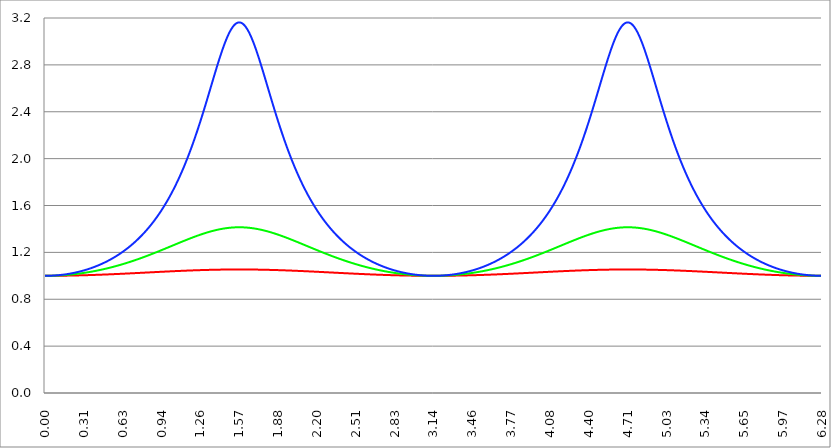
| Category | Series 1 | Series 0 | Series 2 |
|---|---|---|---|
| 0.0 | 1 | 1 | 1 |
| 0.00314159265358979 | 1 | 1 | 1 |
| 0.00628318530717958 | 1 | 1 | 1 |
| 0.00942477796076938 | 1 | 1 | 1 |
| 0.0125663706143592 | 1 | 1 | 1 |
| 0.015707963267949 | 1 | 1 | 1 |
| 0.0188495559215388 | 1 | 1 | 1 |
| 0.0219911485751285 | 1 | 1 | 1 |
| 0.0251327412287183 | 1 | 1 | 1 |
| 0.0282743338823081 | 1 | 1 | 1 |
| 0.0314159265358979 | 1 | 1 | 1 |
| 0.0345575191894877 | 1 | 1 | 1.001 |
| 0.0376991118430775 | 1 | 1 | 1.001 |
| 0.0408407044966673 | 1 | 1 | 1.001 |
| 0.0439822971502571 | 1 | 1 | 1.001 |
| 0.0471238898038469 | 1 | 1.001 | 1.001 |
| 0.0502654824574367 | 1 | 1.001 | 1.001 |
| 0.0534070751110265 | 1 | 1.001 | 1.001 |
| 0.0565486677646163 | 1 | 1.001 | 1.001 |
| 0.059690260418206 | 1 | 1.001 | 1.002 |
| 0.0628318530717958 | 1 | 1.001 | 1.002 |
| 0.0659734457253856 | 1 | 1.001 | 1.002 |
| 0.0691150383789754 | 1 | 1.001 | 1.002 |
| 0.0722566310325652 | 1 | 1.001 | 1.002 |
| 0.075398223686155 | 1 | 1.001 | 1.003 |
| 0.0785398163397448 | 1 | 1.002 | 1.003 |
| 0.0816814089933346 | 1 | 1.002 | 1.003 |
| 0.0848230016469244 | 1 | 1.002 | 1.003 |
| 0.0879645943005142 | 1 | 1.002 | 1.003 |
| 0.091106186954104 | 1 | 1.002 | 1.004 |
| 0.0942477796076937 | 1 | 1.002 | 1.004 |
| 0.0973893722612835 | 1 | 1.002 | 1.004 |
| 0.100530964914873 | 1.001 | 1.003 | 1.005 |
| 0.103672557568463 | 1.001 | 1.003 | 1.005 |
| 0.106814150222053 | 1.001 | 1.003 | 1.005 |
| 0.109955742875643 | 1.001 | 1.003 | 1.005 |
| 0.113097335529233 | 1.001 | 1.003 | 1.006 |
| 0.116238928182822 | 1.001 | 1.003 | 1.006 |
| 0.119380520836412 | 1.001 | 1.004 | 1.006 |
| 0.122522113490002 | 1.001 | 1.004 | 1.007 |
| 0.125663706143592 | 1.001 | 1.004 | 1.007 |
| 0.128805298797181 | 1.001 | 1.004 | 1.008 |
| 0.131946891450771 | 1.001 | 1.004 | 1.008 |
| 0.135088484104361 | 1.001 | 1.005 | 1.008 |
| 0.138230076757951 | 1.001 | 1.005 | 1.009 |
| 0.141371669411541 | 1.001 | 1.005 | 1.009 |
| 0.14451326206513 | 1.001 | 1.005 | 1.009 |
| 0.14765485471872 | 1.001 | 1.005 | 1.01 |
| 0.15079644737231 | 1.001 | 1.006 | 1.01 |
| 0.1539380400259 | 1.001 | 1.006 | 1.011 |
| 0.15707963267949 | 1.001 | 1.006 | 1.011 |
| 0.160221225333079 | 1.001 | 1.006 | 1.012 |
| 0.163362817986669 | 1.001 | 1.007 | 1.012 |
| 0.166504410640259 | 1.001 | 1.007 | 1.013 |
| 0.169646003293849 | 1.001 | 1.007 | 1.013 |
| 0.172787595947439 | 1.001 | 1.007 | 1.014 |
| 0.175929188601028 | 1.002 | 1.008 | 1.014 |
| 0.179070781254618 | 1.002 | 1.008 | 1.015 |
| 0.182212373908208 | 1.002 | 1.008 | 1.015 |
| 0.185353966561798 | 1.002 | 1.009 | 1.016 |
| 0.188495559215388 | 1.002 | 1.009 | 1.016 |
| 0.191637151868977 | 1.002 | 1.009 | 1.017 |
| 0.194778744522567 | 1.002 | 1.009 | 1.017 |
| 0.197920337176157 | 1.002 | 1.01 | 1.018 |
| 0.201061929829747 | 1.002 | 1.01 | 1.018 |
| 0.204203522483336 | 1.002 | 1.01 | 1.019 |
| 0.207345115136926 | 1.002 | 1.011 | 1.02 |
| 0.210486707790516 | 1.002 | 1.011 | 1.02 |
| 0.213628300444106 | 1.002 | 1.011 | 1.021 |
| 0.216769893097696 | 1.002 | 1.012 | 1.021 |
| 0.219911485751285 | 1.002 | 1.012 | 1.022 |
| 0.223053078404875 | 1.002 | 1.012 | 1.023 |
| 0.226194671058465 | 1.003 | 1.013 | 1.023 |
| 0.229336263712055 | 1.003 | 1.013 | 1.024 |
| 0.232477856365645 | 1.003 | 1.014 | 1.025 |
| 0.235619449019234 | 1.003 | 1.014 | 1.025 |
| 0.238761041672824 | 1.003 | 1.014 | 1.026 |
| 0.241902634326414 | 1.003 | 1.015 | 1.027 |
| 0.245044226980004 | 1.003 | 1.015 | 1.028 |
| 0.248185819633594 | 1.003 | 1.015 | 1.028 |
| 0.251327412287183 | 1.003 | 1.016 | 1.029 |
| 0.254469004940773 | 1.003 | 1.016 | 1.03 |
| 0.257610597594363 | 1.003 | 1.017 | 1.031 |
| 0.260752190247953 | 1.003 | 1.017 | 1.031 |
| 0.263893782901543 | 1.003 | 1.017 | 1.032 |
| 0.267035375555132 | 1.003 | 1.018 | 1.033 |
| 0.270176968208722 | 1.004 | 1.018 | 1.034 |
| 0.273318560862312 | 1.004 | 1.019 | 1.034 |
| 0.276460153515902 | 1.004 | 1.019 | 1.035 |
| 0.279601746169492 | 1.004 | 1.02 | 1.036 |
| 0.282743338823082 | 1.004 | 1.02 | 1.037 |
| 0.285884931476671 | 1.004 | 1.02 | 1.038 |
| 0.289026524130261 | 1.004 | 1.021 | 1.039 |
| 0.292168116783851 | 1.004 | 1.021 | 1.04 |
| 0.295309709437441 | 1.004 | 1.022 | 1.04 |
| 0.298451302091031 | 1.004 | 1.022 | 1.041 |
| 0.30159289474462 | 1.004 | 1.023 | 1.042 |
| 0.30473448739821 | 1.005 | 1.023 | 1.043 |
| 0.3078760800518 | 1.005 | 1.024 | 1.044 |
| 0.31101767270539 | 1.005 | 1.024 | 1.045 |
| 0.31415926535898 | 1.005 | 1.025 | 1.046 |
| 0.31730085801257 | 1.005 | 1.025 | 1.047 |
| 0.320442450666159 | 1.005 | 1.026 | 1.048 |
| 0.323584043319749 | 1.005 | 1.026 | 1.049 |
| 0.326725635973339 | 1.005 | 1.027 | 1.05 |
| 0.329867228626929 | 1.005 | 1.027 | 1.051 |
| 0.333008821280519 | 1.005 | 1.028 | 1.052 |
| 0.336150413934108 | 1.005 | 1.028 | 1.053 |
| 0.339292006587698 | 1.006 | 1.029 | 1.054 |
| 0.342433599241288 | 1.006 | 1.029 | 1.055 |
| 0.345575191894878 | 1.006 | 1.03 | 1.056 |
| 0.348716784548468 | 1.006 | 1.031 | 1.057 |
| 0.351858377202058 | 1.006 | 1.031 | 1.058 |
| 0.354999969855647 | 1.006 | 1.032 | 1.059 |
| 0.358141562509237 | 1.006 | 1.032 | 1.06 |
| 0.361283155162827 | 1.006 | 1.033 | 1.061 |
| 0.364424747816417 | 1.006 | 1.033 | 1.063 |
| 0.367566340470007 | 1.007 | 1.034 | 1.064 |
| 0.370707933123597 | 1.007 | 1.035 | 1.065 |
| 0.373849525777186 | 1.007 | 1.035 | 1.066 |
| 0.376991118430776 | 1.007 | 1.036 | 1.067 |
| 0.380132711084366 | 1.007 | 1.036 | 1.068 |
| 0.383274303737956 | 1.007 | 1.037 | 1.07 |
| 0.386415896391546 | 1.007 | 1.038 | 1.071 |
| 0.389557489045135 | 1.007 | 1.038 | 1.072 |
| 0.392699081698725 | 1.007 | 1.039 | 1.073 |
| 0.395840674352315 | 1.008 | 1.039 | 1.074 |
| 0.398982267005905 | 1.008 | 1.04 | 1.076 |
| 0.402123859659495 | 1.008 | 1.041 | 1.077 |
| 0.405265452313085 | 1.008 | 1.041 | 1.078 |
| 0.408407044966674 | 1.008 | 1.042 | 1.08 |
| 0.411548637620264 | 1.008 | 1.043 | 1.081 |
| 0.414690230273854 | 1.008 | 1.043 | 1.082 |
| 0.417831822927444 | 1.008 | 1.044 | 1.084 |
| 0.420973415581034 | 1.008 | 1.045 | 1.085 |
| 0.424115008234623 | 1.009 | 1.045 | 1.086 |
| 0.427256600888213 | 1.009 | 1.046 | 1.088 |
| 0.430398193541803 | 1.009 | 1.047 | 1.089 |
| 0.433539786195393 | 1.009 | 1.047 | 1.09 |
| 0.436681378848983 | 1.009 | 1.048 | 1.092 |
| 0.439822971502573 | 1.009 | 1.049 | 1.093 |
| 0.442964564156162 | 1.009 | 1.049 | 1.095 |
| 0.446106156809752 | 1.009 | 1.05 | 1.096 |
| 0.449247749463342 | 1.01 | 1.051 | 1.097 |
| 0.452389342116932 | 1.01 | 1.051 | 1.099 |
| 0.455530934770522 | 1.01 | 1.052 | 1.1 |
| 0.458672527424111 | 1.01 | 1.053 | 1.102 |
| 0.461814120077701 | 1.01 | 1.054 | 1.103 |
| 0.464955712731291 | 1.01 | 1.054 | 1.105 |
| 0.468097305384881 | 1.01 | 1.055 | 1.106 |
| 0.471238898038471 | 1.01 | 1.056 | 1.108 |
| 0.474380490692061 | 1.011 | 1.057 | 1.11 |
| 0.47752208334565 | 1.011 | 1.057 | 1.111 |
| 0.48066367599924 | 1.011 | 1.058 | 1.113 |
| 0.48380526865283 | 1.011 | 1.059 | 1.114 |
| 0.48694686130642 | 1.011 | 1.06 | 1.116 |
| 0.49008845396001 | 1.011 | 1.06 | 1.118 |
| 0.493230046613599 | 1.011 | 1.061 | 1.119 |
| 0.496371639267189 | 1.012 | 1.062 | 1.121 |
| 0.499513231920779 | 1.012 | 1.063 | 1.123 |
| 0.502654824574369 | 1.012 | 1.064 | 1.124 |
| 0.505796417227959 | 1.012 | 1.064 | 1.126 |
| 0.508938009881549 | 1.012 | 1.065 | 1.128 |
| 0.512079602535138 | 1.012 | 1.066 | 1.129 |
| 0.515221195188728 | 1.012 | 1.067 | 1.131 |
| 0.518362787842318 | 1.013 | 1.068 | 1.133 |
| 0.521504380495908 | 1.013 | 1.068 | 1.135 |
| 0.524645973149498 | 1.013 | 1.069 | 1.137 |
| 0.527787565803087 | 1.013 | 1.07 | 1.138 |
| 0.530929158456677 | 1.013 | 1.071 | 1.14 |
| 0.534070751110267 | 1.013 | 1.072 | 1.142 |
| 0.537212343763857 | 1.013 | 1.073 | 1.144 |
| 0.540353936417447 | 1.014 | 1.074 | 1.146 |
| 0.543495529071037 | 1.014 | 1.074 | 1.148 |
| 0.546637121724626 | 1.014 | 1.075 | 1.149 |
| 0.549778714378216 | 1.014 | 1.076 | 1.151 |
| 0.552920307031806 | 1.014 | 1.077 | 1.153 |
| 0.556061899685396 | 1.014 | 1.078 | 1.155 |
| 0.559203492338986 | 1.014 | 1.079 | 1.157 |
| 0.562345084992576 | 1.015 | 1.08 | 1.159 |
| 0.565486677646165 | 1.015 | 1.081 | 1.161 |
| 0.568628270299755 | 1.015 | 1.081 | 1.163 |
| 0.571769862953345 | 1.015 | 1.082 | 1.165 |
| 0.574911455606935 | 1.015 | 1.083 | 1.167 |
| 0.578053048260525 | 1.015 | 1.084 | 1.169 |
| 0.581194640914114 | 1.015 | 1.085 | 1.171 |
| 0.584336233567704 | 1.016 | 1.086 | 1.174 |
| 0.587477826221294 | 1.016 | 1.087 | 1.176 |
| 0.590619418874884 | 1.016 | 1.088 | 1.178 |
| 0.593761011528474 | 1.016 | 1.089 | 1.18 |
| 0.596902604182064 | 1.016 | 1.09 | 1.182 |
| 0.600044196835653 | 1.016 | 1.091 | 1.184 |
| 0.603185789489243 | 1.016 | 1.092 | 1.186 |
| 0.606327382142833 | 1.017 | 1.093 | 1.189 |
| 0.609468974796423 | 1.017 | 1.094 | 1.191 |
| 0.612610567450013 | 1.017 | 1.095 | 1.193 |
| 0.615752160103602 | 1.017 | 1.096 | 1.195 |
| 0.618893752757192 | 1.017 | 1.097 | 1.198 |
| 0.622035345410782 | 1.017 | 1.097 | 1.2 |
| 0.625176938064372 | 1.018 | 1.098 | 1.202 |
| 0.628318530717962 | 1.018 | 1.099 | 1.205 |
| 0.631460123371551 | 1.018 | 1.1 | 1.207 |
| 0.634601716025141 | 1.018 | 1.101 | 1.209 |
| 0.637743308678731 | 1.018 | 1.102 | 1.212 |
| 0.640884901332321 | 1.018 | 1.103 | 1.214 |
| 0.644026493985911 | 1.019 | 1.104 | 1.217 |
| 0.647168086639501 | 1.019 | 1.106 | 1.219 |
| 0.65030967929309 | 1.019 | 1.107 | 1.222 |
| 0.65345127194668 | 1.019 | 1.108 | 1.224 |
| 0.65659286460027 | 1.019 | 1.109 | 1.227 |
| 0.65973445725386 | 1.019 | 1.11 | 1.229 |
| 0.66287604990745 | 1.019 | 1.111 | 1.232 |
| 0.666017642561039 | 1.02 | 1.112 | 1.234 |
| 0.669159235214629 | 1.02 | 1.113 | 1.237 |
| 0.672300827868219 | 1.02 | 1.114 | 1.239 |
| 0.675442420521809 | 1.02 | 1.115 | 1.242 |
| 0.678584013175399 | 1.02 | 1.116 | 1.245 |
| 0.681725605828989 | 1.02 | 1.117 | 1.247 |
| 0.684867198482578 | 1.021 | 1.118 | 1.25 |
| 0.688008791136168 | 1.021 | 1.119 | 1.253 |
| 0.691150383789758 | 1.021 | 1.12 | 1.256 |
| 0.694291976443348 | 1.021 | 1.121 | 1.258 |
| 0.697433569096938 | 1.021 | 1.122 | 1.261 |
| 0.700575161750528 | 1.021 | 1.124 | 1.264 |
| 0.703716754404117 | 1.022 | 1.125 | 1.267 |
| 0.706858347057707 | 1.022 | 1.126 | 1.27 |
| 0.709999939711297 | 1.022 | 1.127 | 1.272 |
| 0.713141532364887 | 1.022 | 1.128 | 1.275 |
| 0.716283125018477 | 1.022 | 1.129 | 1.278 |
| 0.719424717672066 | 1.022 | 1.13 | 1.281 |
| 0.722566310325656 | 1.023 | 1.131 | 1.284 |
| 0.725707902979246 | 1.023 | 1.132 | 1.287 |
| 0.728849495632836 | 1.023 | 1.134 | 1.29 |
| 0.731991088286426 | 1.023 | 1.135 | 1.293 |
| 0.735132680940016 | 1.023 | 1.136 | 1.296 |
| 0.738274273593605 | 1.023 | 1.137 | 1.299 |
| 0.741415866247195 | 1.024 | 1.138 | 1.302 |
| 0.744557458900785 | 1.024 | 1.139 | 1.306 |
| 0.747699051554375 | 1.024 | 1.14 | 1.309 |
| 0.750840644207965 | 1.024 | 1.142 | 1.312 |
| 0.753982236861554 | 1.024 | 1.143 | 1.315 |
| 0.757123829515144 | 1.024 | 1.144 | 1.318 |
| 0.760265422168734 | 1.025 | 1.145 | 1.322 |
| 0.763407014822324 | 1.025 | 1.146 | 1.325 |
| 0.766548607475914 | 1.025 | 1.148 | 1.328 |
| 0.769690200129504 | 1.025 | 1.149 | 1.331 |
| 0.772831792783093 | 1.025 | 1.15 | 1.335 |
| 0.775973385436683 | 1.025 | 1.151 | 1.338 |
| 0.779114978090273 | 1.026 | 1.152 | 1.342 |
| 0.782256570743863 | 1.026 | 1.153 | 1.345 |
| 0.785398163397453 | 1.026 | 1.155 | 1.348 |
| 0.788539756051042 | 1.026 | 1.156 | 1.352 |
| 0.791681348704632 | 1.026 | 1.157 | 1.355 |
| 0.794822941358222 | 1.026 | 1.158 | 1.359 |
| 0.797964534011812 | 1.027 | 1.16 | 1.362 |
| 0.801106126665402 | 1.027 | 1.161 | 1.366 |
| 0.804247719318992 | 1.027 | 1.162 | 1.37 |
| 0.807389311972581 | 1.027 | 1.163 | 1.373 |
| 0.810530904626171 | 1.027 | 1.164 | 1.377 |
| 0.813672497279761 | 1.028 | 1.166 | 1.381 |
| 0.816814089933351 | 1.028 | 1.167 | 1.384 |
| 0.819955682586941 | 1.028 | 1.168 | 1.388 |
| 0.823097275240531 | 1.028 | 1.169 | 1.392 |
| 0.82623886789412 | 1.028 | 1.171 | 1.396 |
| 0.82938046054771 | 1.028 | 1.172 | 1.4 |
| 0.8325220532013 | 1.029 | 1.173 | 1.404 |
| 0.83566364585489 | 1.029 | 1.175 | 1.407 |
| 0.83880523850848 | 1.029 | 1.176 | 1.411 |
| 0.841946831162069 | 1.029 | 1.177 | 1.415 |
| 0.845088423815659 | 1.029 | 1.178 | 1.419 |
| 0.848230016469249 | 1.029 | 1.18 | 1.423 |
| 0.851371609122839 | 1.03 | 1.181 | 1.427 |
| 0.854513201776429 | 1.03 | 1.182 | 1.432 |
| 0.857654794430019 | 1.03 | 1.183 | 1.436 |
| 0.860796387083608 | 1.03 | 1.185 | 1.44 |
| 0.863937979737198 | 1.03 | 1.186 | 1.444 |
| 0.867079572390788 | 1.03 | 1.187 | 1.448 |
| 0.870221165044378 | 1.031 | 1.189 | 1.452 |
| 0.873362757697968 | 1.031 | 1.19 | 1.457 |
| 0.876504350351557 | 1.031 | 1.191 | 1.461 |
| 0.879645943005147 | 1.031 | 1.193 | 1.465 |
| 0.882787535658737 | 1.031 | 1.194 | 1.47 |
| 0.885929128312327 | 1.031 | 1.195 | 1.474 |
| 0.889070720965917 | 1.032 | 1.196 | 1.479 |
| 0.892212313619507 | 1.032 | 1.198 | 1.483 |
| 0.895353906273096 | 1.032 | 1.199 | 1.488 |
| 0.898495498926686 | 1.032 | 1.2 | 1.492 |
| 0.901637091580276 | 1.032 | 1.202 | 1.497 |
| 0.904778684233866 | 1.032 | 1.203 | 1.501 |
| 0.907920276887456 | 1.033 | 1.204 | 1.506 |
| 0.911061869541045 | 1.033 | 1.206 | 1.511 |
| 0.914203462194635 | 1.033 | 1.207 | 1.516 |
| 0.917345054848225 | 1.033 | 1.208 | 1.52 |
| 0.920486647501815 | 1.033 | 1.21 | 1.525 |
| 0.923628240155405 | 1.033 | 1.211 | 1.53 |
| 0.926769832808995 | 1.034 | 1.212 | 1.535 |
| 0.929911425462584 | 1.034 | 1.214 | 1.54 |
| 0.933053018116174 | 1.034 | 1.215 | 1.545 |
| 0.936194610769764 | 1.034 | 1.216 | 1.55 |
| 0.939336203423354 | 1.034 | 1.218 | 1.555 |
| 0.942477796076944 | 1.034 | 1.219 | 1.56 |
| 0.945619388730533 | 1.035 | 1.221 | 1.565 |
| 0.948760981384123 | 1.035 | 1.222 | 1.57 |
| 0.951902574037713 | 1.035 | 1.223 | 1.575 |
| 0.955044166691303 | 1.035 | 1.225 | 1.581 |
| 0.958185759344893 | 1.035 | 1.226 | 1.586 |
| 0.961327351998483 | 1.035 | 1.227 | 1.591 |
| 0.964468944652072 | 1.036 | 1.229 | 1.597 |
| 0.967610537305662 | 1.036 | 1.23 | 1.602 |
| 0.970752129959252 | 1.036 | 1.231 | 1.608 |
| 0.973893722612842 | 1.036 | 1.233 | 1.613 |
| 0.977035315266432 | 1.036 | 1.234 | 1.619 |
| 0.980176907920022 | 1.036 | 1.236 | 1.624 |
| 0.983318500573611 | 1.037 | 1.237 | 1.63 |
| 0.986460093227201 | 1.037 | 1.238 | 1.635 |
| 0.989601685880791 | 1.037 | 1.24 | 1.641 |
| 0.992743278534381 | 1.037 | 1.241 | 1.647 |
| 0.995884871187971 | 1.037 | 1.242 | 1.653 |
| 0.99902646384156 | 1.037 | 1.244 | 1.659 |
| 1.00216805649515 | 1.038 | 1.245 | 1.664 |
| 1.00530964914874 | 1.038 | 1.247 | 1.67 |
| 1.00845124180233 | 1.038 | 1.248 | 1.676 |
| 1.01159283445592 | 1.038 | 1.249 | 1.682 |
| 1.01473442710951 | 1.038 | 1.251 | 1.688 |
| 1.017876019763099 | 1.038 | 1.252 | 1.695 |
| 1.021017612416689 | 1.038 | 1.253 | 1.701 |
| 1.02415920507028 | 1.039 | 1.255 | 1.707 |
| 1.027300797723869 | 1.039 | 1.256 | 1.713 |
| 1.030442390377459 | 1.039 | 1.258 | 1.72 |
| 1.033583983031048 | 1.039 | 1.259 | 1.726 |
| 1.036725575684638 | 1.039 | 1.26 | 1.732 |
| 1.039867168338228 | 1.039 | 1.262 | 1.739 |
| 1.043008760991818 | 1.04 | 1.263 | 1.745 |
| 1.046150353645408 | 1.04 | 1.264 | 1.752 |
| 1.049291946298998 | 1.04 | 1.266 | 1.759 |
| 1.052433538952587 | 1.04 | 1.267 | 1.765 |
| 1.055575131606177 | 1.04 | 1.269 | 1.772 |
| 1.058716724259767 | 1.04 | 1.27 | 1.779 |
| 1.061858316913357 | 1.04 | 1.271 | 1.786 |
| 1.064999909566947 | 1.041 | 1.273 | 1.792 |
| 1.068141502220536 | 1.041 | 1.274 | 1.799 |
| 1.071283094874126 | 1.041 | 1.275 | 1.806 |
| 1.074424687527716 | 1.041 | 1.277 | 1.813 |
| 1.077566280181306 | 1.041 | 1.278 | 1.82 |
| 1.080707872834896 | 1.041 | 1.28 | 1.828 |
| 1.083849465488486 | 1.041 | 1.281 | 1.835 |
| 1.086991058142075 | 1.042 | 1.282 | 1.842 |
| 1.090132650795665 | 1.042 | 1.284 | 1.849 |
| 1.093274243449255 | 1.042 | 1.285 | 1.857 |
| 1.096415836102845 | 1.042 | 1.286 | 1.864 |
| 1.099557428756435 | 1.042 | 1.288 | 1.872 |
| 1.102699021410025 | 1.042 | 1.289 | 1.879 |
| 1.105840614063614 | 1.043 | 1.29 | 1.887 |
| 1.108982206717204 | 1.043 | 1.292 | 1.894 |
| 1.112123799370794 | 1.043 | 1.293 | 1.902 |
| 1.115265392024384 | 1.043 | 1.294 | 1.91 |
| 1.118406984677974 | 1.043 | 1.296 | 1.918 |
| 1.121548577331563 | 1.043 | 1.297 | 1.925 |
| 1.124690169985153 | 1.043 | 1.299 | 1.933 |
| 1.127831762638743 | 1.043 | 1.3 | 1.941 |
| 1.130973355292333 | 1.044 | 1.301 | 1.949 |
| 1.134114947945923 | 1.044 | 1.303 | 1.957 |
| 1.137256540599513 | 1.044 | 1.304 | 1.966 |
| 1.140398133253102 | 1.044 | 1.305 | 1.974 |
| 1.143539725906692 | 1.044 | 1.306 | 1.982 |
| 1.146681318560282 | 1.044 | 1.308 | 1.99 |
| 1.149822911213872 | 1.044 | 1.309 | 1.999 |
| 1.152964503867462 | 1.045 | 1.31 | 2.007 |
| 1.156106096521051 | 1.045 | 1.312 | 2.016 |
| 1.159247689174641 | 1.045 | 1.313 | 2.024 |
| 1.162389281828231 | 1.045 | 1.314 | 2.033 |
| 1.165530874481821 | 1.045 | 1.316 | 2.042 |
| 1.168672467135411 | 1.045 | 1.317 | 2.05 |
| 1.171814059789001 | 1.045 | 1.318 | 2.059 |
| 1.17495565244259 | 1.045 | 1.32 | 2.068 |
| 1.17809724509618 | 1.046 | 1.321 | 2.077 |
| 1.18123883774977 | 1.046 | 1.322 | 2.086 |
| 1.18438043040336 | 1.046 | 1.323 | 2.095 |
| 1.18752202305695 | 1.046 | 1.325 | 2.104 |
| 1.190663615710539 | 1.046 | 1.326 | 2.113 |
| 1.193805208364129 | 1.046 | 1.327 | 2.123 |
| 1.19694680101772 | 1.046 | 1.328 | 2.132 |
| 1.200088393671309 | 1.046 | 1.33 | 2.141 |
| 1.203229986324899 | 1.047 | 1.331 | 2.151 |
| 1.206371578978489 | 1.047 | 1.332 | 2.16 |
| 1.209513171632078 | 1.047 | 1.333 | 2.17 |
| 1.212654764285668 | 1.047 | 1.335 | 2.179 |
| 1.215796356939258 | 1.047 | 1.336 | 2.189 |
| 1.218937949592848 | 1.047 | 1.337 | 2.198 |
| 1.222079542246438 | 1.047 | 1.338 | 2.208 |
| 1.225221134900027 | 1.047 | 1.339 | 2.218 |
| 1.228362727553617 | 1.048 | 1.341 | 2.228 |
| 1.231504320207207 | 1.048 | 1.342 | 2.238 |
| 1.234645912860797 | 1.048 | 1.343 | 2.248 |
| 1.237787505514387 | 1.048 | 1.344 | 2.258 |
| 1.240929098167977 | 1.048 | 1.345 | 2.268 |
| 1.244070690821566 | 1.048 | 1.347 | 2.278 |
| 1.247212283475156 | 1.048 | 1.348 | 2.288 |
| 1.250353876128746 | 1.048 | 1.349 | 2.298 |
| 1.253495468782336 | 1.048 | 1.35 | 2.309 |
| 1.256637061435926 | 1.049 | 1.351 | 2.319 |
| 1.259778654089515 | 1.049 | 1.352 | 2.329 |
| 1.262920246743105 | 1.049 | 1.353 | 2.34 |
| 1.266061839396695 | 1.049 | 1.355 | 2.35 |
| 1.269203432050285 | 1.049 | 1.356 | 2.361 |
| 1.272345024703875 | 1.049 | 1.357 | 2.371 |
| 1.275486617357465 | 1.049 | 1.358 | 2.382 |
| 1.278628210011054 | 1.049 | 1.359 | 2.393 |
| 1.281769802664644 | 1.049 | 1.36 | 2.403 |
| 1.284911395318234 | 1.049 | 1.361 | 2.414 |
| 1.288052987971824 | 1.05 | 1.362 | 2.425 |
| 1.291194580625414 | 1.05 | 1.363 | 2.436 |
| 1.294336173279003 | 1.05 | 1.364 | 2.447 |
| 1.297477765932593 | 1.05 | 1.365 | 2.458 |
| 1.300619358586183 | 1.05 | 1.366 | 2.468 |
| 1.303760951239773 | 1.05 | 1.367 | 2.479 |
| 1.306902543893363 | 1.05 | 1.368 | 2.49 |
| 1.310044136546953 | 1.05 | 1.369 | 2.501 |
| 1.313185729200542 | 1.05 | 1.37 | 2.512 |
| 1.316327321854132 | 1.05 | 1.371 | 2.524 |
| 1.319468914507722 | 1.05 | 1.372 | 2.535 |
| 1.322610507161312 | 1.051 | 1.373 | 2.546 |
| 1.325752099814902 | 1.051 | 1.374 | 2.557 |
| 1.328893692468491 | 1.051 | 1.375 | 2.568 |
| 1.332035285122081 | 1.051 | 1.376 | 2.579 |
| 1.335176877775671 | 1.051 | 1.377 | 2.59 |
| 1.338318470429261 | 1.051 | 1.378 | 2.601 |
| 1.341460063082851 | 1.051 | 1.379 | 2.613 |
| 1.344601655736441 | 1.051 | 1.38 | 2.624 |
| 1.34774324839003 | 1.051 | 1.381 | 2.635 |
| 1.35088484104362 | 1.051 | 1.382 | 2.646 |
| 1.35402643369721 | 1.051 | 1.383 | 2.657 |
| 1.3571680263508 | 1.051 | 1.383 | 2.668 |
| 1.36030961900439 | 1.052 | 1.384 | 2.679 |
| 1.363451211657979 | 1.052 | 1.385 | 2.691 |
| 1.36659280431157 | 1.052 | 1.386 | 2.702 |
| 1.369734396965159 | 1.052 | 1.387 | 2.713 |
| 1.372875989618749 | 1.052 | 1.388 | 2.724 |
| 1.376017582272339 | 1.052 | 1.388 | 2.735 |
| 1.379159174925929 | 1.052 | 1.389 | 2.746 |
| 1.382300767579518 | 1.052 | 1.39 | 2.757 |
| 1.385442360233108 | 1.052 | 1.391 | 2.767 |
| 1.388583952886698 | 1.052 | 1.392 | 2.778 |
| 1.391725545540288 | 1.052 | 1.392 | 2.789 |
| 1.394867138193878 | 1.052 | 1.393 | 2.8 |
| 1.398008730847468 | 1.052 | 1.394 | 2.81 |
| 1.401150323501057 | 1.052 | 1.394 | 2.821 |
| 1.404291916154647 | 1.052 | 1.395 | 2.832 |
| 1.407433508808237 | 1.053 | 1.396 | 2.842 |
| 1.410575101461827 | 1.053 | 1.397 | 2.852 |
| 1.413716694115417 | 1.053 | 1.397 | 2.863 |
| 1.416858286769006 | 1.053 | 1.398 | 2.873 |
| 1.419999879422596 | 1.053 | 1.399 | 2.883 |
| 1.423141472076186 | 1.053 | 1.399 | 2.893 |
| 1.426283064729776 | 1.053 | 1.4 | 2.903 |
| 1.429424657383366 | 1.053 | 1.4 | 2.913 |
| 1.432566250036956 | 1.053 | 1.401 | 2.922 |
| 1.435707842690545 | 1.053 | 1.402 | 2.932 |
| 1.438849435344135 | 1.053 | 1.402 | 2.941 |
| 1.441991027997725 | 1.053 | 1.403 | 2.951 |
| 1.445132620651315 | 1.053 | 1.403 | 2.96 |
| 1.448274213304905 | 1.053 | 1.404 | 2.969 |
| 1.451415805958494 | 1.053 | 1.404 | 2.978 |
| 1.454557398612084 | 1.053 | 1.405 | 2.987 |
| 1.457698991265674 | 1.053 | 1.405 | 2.995 |
| 1.460840583919264 | 1.053 | 1.406 | 3.004 |
| 1.463982176572854 | 1.053 | 1.406 | 3.012 |
| 1.467123769226444 | 1.053 | 1.407 | 3.02 |
| 1.470265361880033 | 1.054 | 1.407 | 3.028 |
| 1.473406954533623 | 1.054 | 1.408 | 3.036 |
| 1.476548547187213 | 1.054 | 1.408 | 3.043 |
| 1.479690139840803 | 1.054 | 1.408 | 3.051 |
| 1.482831732494393 | 1.054 | 1.409 | 3.058 |
| 1.485973325147982 | 1.054 | 1.409 | 3.065 |
| 1.489114917801572 | 1.054 | 1.41 | 3.072 |
| 1.492256510455162 | 1.054 | 1.41 | 3.078 |
| 1.495398103108752 | 1.054 | 1.41 | 3.084 |
| 1.498539695762342 | 1.054 | 1.411 | 3.091 |
| 1.501681288415932 | 1.054 | 1.411 | 3.097 |
| 1.504822881069521 | 1.054 | 1.411 | 3.102 |
| 1.507964473723111 | 1.054 | 1.411 | 3.108 |
| 1.511106066376701 | 1.054 | 1.412 | 3.113 |
| 1.514247659030291 | 1.054 | 1.412 | 3.118 |
| 1.517389251683881 | 1.054 | 1.412 | 3.122 |
| 1.520530844337471 | 1.054 | 1.412 | 3.127 |
| 1.52367243699106 | 1.054 | 1.413 | 3.131 |
| 1.52681402964465 | 1.054 | 1.413 | 3.135 |
| 1.52995562229824 | 1.054 | 1.413 | 3.139 |
| 1.53309721495183 | 1.054 | 1.413 | 3.142 |
| 1.53623880760542 | 1.054 | 1.413 | 3.145 |
| 1.539380400259009 | 1.054 | 1.414 | 3.148 |
| 1.542521992912599 | 1.054 | 1.414 | 3.151 |
| 1.545663585566189 | 1.054 | 1.414 | 3.153 |
| 1.548805178219779 | 1.054 | 1.414 | 3.155 |
| 1.551946770873369 | 1.054 | 1.414 | 3.157 |
| 1.555088363526959 | 1.054 | 1.414 | 3.159 |
| 1.558229956180548 | 1.054 | 1.414 | 3.16 |
| 1.561371548834138 | 1.054 | 1.414 | 3.161 |
| 1.564513141487728 | 1.054 | 1.414 | 3.162 |
| 1.567654734141318 | 1.054 | 1.414 | 3.162 |
| 1.570796326794908 | 1.054 | 1.414 | 3.162 |
| 1.573937919448497 | 1.054 | 1.414 | 3.162 |
| 1.577079512102087 | 1.054 | 1.414 | 3.162 |
| 1.580221104755677 | 1.054 | 1.414 | 3.161 |
| 1.583362697409267 | 1.054 | 1.414 | 3.16 |
| 1.586504290062857 | 1.054 | 1.414 | 3.159 |
| 1.589645882716447 | 1.054 | 1.414 | 3.157 |
| 1.592787475370036 | 1.054 | 1.414 | 3.155 |
| 1.595929068023626 | 1.054 | 1.414 | 3.153 |
| 1.599070660677216 | 1.054 | 1.414 | 3.151 |
| 1.602212253330806 | 1.054 | 1.414 | 3.148 |
| 1.605353845984396 | 1.054 | 1.413 | 3.145 |
| 1.608495438637985 | 1.054 | 1.413 | 3.142 |
| 1.611637031291575 | 1.054 | 1.413 | 3.139 |
| 1.614778623945165 | 1.054 | 1.413 | 3.135 |
| 1.617920216598755 | 1.054 | 1.413 | 3.131 |
| 1.621061809252345 | 1.054 | 1.412 | 3.127 |
| 1.624203401905935 | 1.054 | 1.412 | 3.122 |
| 1.627344994559524 | 1.054 | 1.412 | 3.118 |
| 1.630486587213114 | 1.054 | 1.412 | 3.113 |
| 1.633628179866704 | 1.054 | 1.411 | 3.108 |
| 1.636769772520294 | 1.054 | 1.411 | 3.102 |
| 1.639911365173884 | 1.054 | 1.411 | 3.097 |
| 1.643052957827473 | 1.054 | 1.411 | 3.091 |
| 1.646194550481063 | 1.054 | 1.41 | 3.084 |
| 1.649336143134653 | 1.054 | 1.41 | 3.078 |
| 1.652477735788243 | 1.054 | 1.41 | 3.072 |
| 1.655619328441833 | 1.054 | 1.409 | 3.065 |
| 1.658760921095423 | 1.054 | 1.409 | 3.058 |
| 1.661902513749012 | 1.054 | 1.408 | 3.051 |
| 1.665044106402602 | 1.054 | 1.408 | 3.043 |
| 1.668185699056192 | 1.054 | 1.408 | 3.036 |
| 1.671327291709782 | 1.054 | 1.407 | 3.028 |
| 1.674468884363372 | 1.053 | 1.407 | 3.02 |
| 1.677610477016961 | 1.053 | 1.406 | 3.012 |
| 1.680752069670551 | 1.053 | 1.406 | 3.004 |
| 1.683893662324141 | 1.053 | 1.405 | 2.995 |
| 1.687035254977731 | 1.053 | 1.405 | 2.987 |
| 1.690176847631321 | 1.053 | 1.404 | 2.978 |
| 1.693318440284911 | 1.053 | 1.404 | 2.969 |
| 1.6964600329385 | 1.053 | 1.403 | 2.96 |
| 1.69960162559209 | 1.053 | 1.403 | 2.951 |
| 1.70274321824568 | 1.053 | 1.402 | 2.941 |
| 1.70588481089927 | 1.053 | 1.402 | 2.932 |
| 1.70902640355286 | 1.053 | 1.401 | 2.922 |
| 1.712167996206449 | 1.053 | 1.4 | 2.913 |
| 1.715309588860039 | 1.053 | 1.4 | 2.903 |
| 1.71845118151363 | 1.053 | 1.399 | 2.893 |
| 1.721592774167219 | 1.053 | 1.399 | 2.883 |
| 1.724734366820809 | 1.053 | 1.398 | 2.873 |
| 1.727875959474399 | 1.053 | 1.397 | 2.863 |
| 1.731017552127988 | 1.053 | 1.397 | 2.852 |
| 1.734159144781578 | 1.053 | 1.396 | 2.842 |
| 1.737300737435168 | 1.052 | 1.395 | 2.832 |
| 1.740442330088758 | 1.052 | 1.394 | 2.821 |
| 1.743583922742348 | 1.052 | 1.394 | 2.81 |
| 1.746725515395937 | 1.052 | 1.393 | 2.8 |
| 1.749867108049527 | 1.052 | 1.392 | 2.789 |
| 1.753008700703117 | 1.052 | 1.392 | 2.778 |
| 1.756150293356707 | 1.052 | 1.391 | 2.767 |
| 1.759291886010297 | 1.052 | 1.39 | 2.757 |
| 1.762433478663887 | 1.052 | 1.389 | 2.746 |
| 1.765575071317476 | 1.052 | 1.388 | 2.735 |
| 1.768716663971066 | 1.052 | 1.388 | 2.724 |
| 1.771858256624656 | 1.052 | 1.387 | 2.713 |
| 1.774999849278246 | 1.052 | 1.386 | 2.702 |
| 1.778141441931836 | 1.052 | 1.385 | 2.691 |
| 1.781283034585426 | 1.052 | 1.384 | 2.679 |
| 1.784424627239015 | 1.051 | 1.383 | 2.668 |
| 1.787566219892605 | 1.051 | 1.383 | 2.657 |
| 1.790707812546195 | 1.051 | 1.382 | 2.646 |
| 1.793849405199785 | 1.051 | 1.381 | 2.635 |
| 1.796990997853375 | 1.051 | 1.38 | 2.624 |
| 1.800132590506964 | 1.051 | 1.379 | 2.613 |
| 1.803274183160554 | 1.051 | 1.378 | 2.601 |
| 1.806415775814144 | 1.051 | 1.377 | 2.59 |
| 1.809557368467734 | 1.051 | 1.376 | 2.579 |
| 1.812698961121324 | 1.051 | 1.375 | 2.568 |
| 1.815840553774914 | 1.051 | 1.374 | 2.557 |
| 1.818982146428503 | 1.051 | 1.373 | 2.546 |
| 1.822123739082093 | 1.05 | 1.372 | 2.535 |
| 1.825265331735683 | 1.05 | 1.371 | 2.524 |
| 1.828406924389273 | 1.05 | 1.37 | 2.512 |
| 1.831548517042863 | 1.05 | 1.369 | 2.501 |
| 1.834690109696452 | 1.05 | 1.368 | 2.49 |
| 1.837831702350042 | 1.05 | 1.367 | 2.479 |
| 1.840973295003632 | 1.05 | 1.366 | 2.468 |
| 1.844114887657222 | 1.05 | 1.365 | 2.458 |
| 1.847256480310812 | 1.05 | 1.364 | 2.447 |
| 1.850398072964402 | 1.05 | 1.363 | 2.436 |
| 1.853539665617991 | 1.05 | 1.362 | 2.425 |
| 1.856681258271581 | 1.049 | 1.361 | 2.414 |
| 1.859822850925171 | 1.049 | 1.36 | 2.403 |
| 1.862964443578761 | 1.049 | 1.359 | 2.393 |
| 1.866106036232351 | 1.049 | 1.358 | 2.382 |
| 1.86924762888594 | 1.049 | 1.357 | 2.371 |
| 1.87238922153953 | 1.049 | 1.356 | 2.361 |
| 1.87553081419312 | 1.049 | 1.355 | 2.35 |
| 1.87867240684671 | 1.049 | 1.353 | 2.34 |
| 1.8818139995003 | 1.049 | 1.352 | 2.329 |
| 1.88495559215389 | 1.049 | 1.351 | 2.319 |
| 1.888097184807479 | 1.048 | 1.35 | 2.309 |
| 1.891238777461069 | 1.048 | 1.349 | 2.298 |
| 1.89438037011466 | 1.048 | 1.348 | 2.288 |
| 1.897521962768249 | 1.048 | 1.347 | 2.278 |
| 1.900663555421839 | 1.048 | 1.345 | 2.268 |
| 1.903805148075429 | 1.048 | 1.344 | 2.258 |
| 1.906946740729018 | 1.048 | 1.343 | 2.248 |
| 1.910088333382608 | 1.048 | 1.342 | 2.238 |
| 1.913229926036198 | 1.048 | 1.341 | 2.228 |
| 1.916371518689788 | 1.047 | 1.339 | 2.218 |
| 1.919513111343378 | 1.047 | 1.338 | 2.208 |
| 1.922654703996967 | 1.047 | 1.337 | 2.198 |
| 1.925796296650557 | 1.047 | 1.336 | 2.189 |
| 1.928937889304147 | 1.047 | 1.335 | 2.179 |
| 1.932079481957737 | 1.047 | 1.333 | 2.17 |
| 1.935221074611327 | 1.047 | 1.332 | 2.16 |
| 1.938362667264917 | 1.047 | 1.331 | 2.151 |
| 1.941504259918506 | 1.046 | 1.33 | 2.141 |
| 1.944645852572096 | 1.046 | 1.328 | 2.132 |
| 1.947787445225686 | 1.046 | 1.327 | 2.123 |
| 1.950929037879276 | 1.046 | 1.326 | 2.113 |
| 1.954070630532866 | 1.046 | 1.325 | 2.104 |
| 1.957212223186455 | 1.046 | 1.323 | 2.095 |
| 1.960353815840045 | 1.046 | 1.322 | 2.086 |
| 1.963495408493635 | 1.046 | 1.321 | 2.077 |
| 1.966637001147225 | 1.045 | 1.32 | 2.068 |
| 1.969778593800815 | 1.045 | 1.318 | 2.059 |
| 1.972920186454405 | 1.045 | 1.317 | 2.05 |
| 1.976061779107994 | 1.045 | 1.316 | 2.042 |
| 1.979203371761584 | 1.045 | 1.314 | 2.033 |
| 1.982344964415174 | 1.045 | 1.313 | 2.024 |
| 1.985486557068764 | 1.045 | 1.312 | 2.016 |
| 1.988628149722354 | 1.045 | 1.31 | 2.007 |
| 1.991769742375943 | 1.044 | 1.309 | 1.999 |
| 1.994911335029533 | 1.044 | 1.308 | 1.99 |
| 1.998052927683123 | 1.044 | 1.306 | 1.982 |
| 2.001194520336712 | 1.044 | 1.305 | 1.974 |
| 2.004336112990302 | 1.044 | 1.304 | 1.966 |
| 2.007477705643892 | 1.044 | 1.303 | 1.957 |
| 2.010619298297482 | 1.044 | 1.301 | 1.949 |
| 2.013760890951071 | 1.043 | 1.3 | 1.941 |
| 2.016902483604661 | 1.043 | 1.299 | 1.933 |
| 2.02004407625825 | 1.043 | 1.297 | 1.925 |
| 2.02318566891184 | 1.043 | 1.296 | 1.918 |
| 2.02632726156543 | 1.043 | 1.294 | 1.91 |
| 2.029468854219019 | 1.043 | 1.293 | 1.902 |
| 2.032610446872609 | 1.043 | 1.292 | 1.894 |
| 2.035752039526198 | 1.043 | 1.29 | 1.887 |
| 2.038893632179788 | 1.042 | 1.289 | 1.879 |
| 2.042035224833378 | 1.042 | 1.288 | 1.872 |
| 2.045176817486967 | 1.042 | 1.286 | 1.864 |
| 2.048318410140557 | 1.042 | 1.285 | 1.857 |
| 2.051460002794146 | 1.042 | 1.284 | 1.849 |
| 2.054601595447736 | 1.042 | 1.282 | 1.842 |
| 2.057743188101325 | 1.041 | 1.281 | 1.835 |
| 2.060884780754915 | 1.041 | 1.28 | 1.828 |
| 2.064026373408505 | 1.041 | 1.278 | 1.82 |
| 2.067167966062094 | 1.041 | 1.277 | 1.813 |
| 2.070309558715684 | 1.041 | 1.275 | 1.806 |
| 2.073451151369273 | 1.041 | 1.274 | 1.799 |
| 2.076592744022863 | 1.041 | 1.273 | 1.792 |
| 2.079734336676452 | 1.04 | 1.271 | 1.786 |
| 2.082875929330042 | 1.04 | 1.27 | 1.779 |
| 2.086017521983632 | 1.04 | 1.269 | 1.772 |
| 2.089159114637221 | 1.04 | 1.267 | 1.765 |
| 2.092300707290811 | 1.04 | 1.266 | 1.759 |
| 2.095442299944401 | 1.04 | 1.264 | 1.752 |
| 2.09858389259799 | 1.04 | 1.263 | 1.745 |
| 2.10172548525158 | 1.039 | 1.262 | 1.739 |
| 2.104867077905169 | 1.039 | 1.26 | 1.732 |
| 2.108008670558759 | 1.039 | 1.259 | 1.726 |
| 2.111150263212349 | 1.039 | 1.258 | 1.72 |
| 2.114291855865938 | 1.039 | 1.256 | 1.713 |
| 2.117433448519528 | 1.039 | 1.255 | 1.707 |
| 2.120575041173117 | 1.038 | 1.253 | 1.701 |
| 2.123716633826707 | 1.038 | 1.252 | 1.695 |
| 2.126858226480297 | 1.038 | 1.251 | 1.688 |
| 2.129999819133886 | 1.038 | 1.249 | 1.682 |
| 2.133141411787476 | 1.038 | 1.248 | 1.676 |
| 2.136283004441065 | 1.038 | 1.247 | 1.67 |
| 2.139424597094655 | 1.038 | 1.245 | 1.664 |
| 2.142566189748245 | 1.037 | 1.244 | 1.659 |
| 2.145707782401834 | 1.037 | 1.242 | 1.653 |
| 2.148849375055424 | 1.037 | 1.241 | 1.647 |
| 2.151990967709013 | 1.037 | 1.24 | 1.641 |
| 2.155132560362603 | 1.037 | 1.238 | 1.635 |
| 2.158274153016193 | 1.037 | 1.237 | 1.63 |
| 2.161415745669782 | 1.036 | 1.236 | 1.624 |
| 2.164557338323372 | 1.036 | 1.234 | 1.619 |
| 2.167698930976961 | 1.036 | 1.233 | 1.613 |
| 2.170840523630551 | 1.036 | 1.231 | 1.608 |
| 2.173982116284141 | 1.036 | 1.23 | 1.602 |
| 2.17712370893773 | 1.036 | 1.229 | 1.597 |
| 2.18026530159132 | 1.035 | 1.227 | 1.591 |
| 2.183406894244909 | 1.035 | 1.226 | 1.586 |
| 2.186548486898499 | 1.035 | 1.225 | 1.581 |
| 2.189690079552089 | 1.035 | 1.223 | 1.575 |
| 2.192831672205678 | 1.035 | 1.222 | 1.57 |
| 2.195973264859268 | 1.035 | 1.221 | 1.565 |
| 2.199114857512857 | 1.034 | 1.219 | 1.56 |
| 2.202256450166447 | 1.034 | 1.218 | 1.555 |
| 2.205398042820036 | 1.034 | 1.216 | 1.55 |
| 2.208539635473626 | 1.034 | 1.215 | 1.545 |
| 2.211681228127216 | 1.034 | 1.214 | 1.54 |
| 2.214822820780805 | 1.034 | 1.212 | 1.535 |
| 2.217964413434395 | 1.033 | 1.211 | 1.53 |
| 2.221106006087984 | 1.033 | 1.21 | 1.525 |
| 2.224247598741574 | 1.033 | 1.208 | 1.52 |
| 2.227389191395164 | 1.033 | 1.207 | 1.516 |
| 2.230530784048753 | 1.033 | 1.206 | 1.511 |
| 2.233672376702343 | 1.033 | 1.204 | 1.506 |
| 2.236813969355933 | 1.032 | 1.203 | 1.501 |
| 2.239955562009522 | 1.032 | 1.202 | 1.497 |
| 2.243097154663112 | 1.032 | 1.2 | 1.492 |
| 2.246238747316701 | 1.032 | 1.199 | 1.488 |
| 2.249380339970291 | 1.032 | 1.198 | 1.483 |
| 2.252521932623881 | 1.032 | 1.196 | 1.479 |
| 2.25566352527747 | 1.031 | 1.195 | 1.474 |
| 2.25880511793106 | 1.031 | 1.194 | 1.47 |
| 2.261946710584649 | 1.031 | 1.193 | 1.465 |
| 2.265088303238239 | 1.031 | 1.191 | 1.461 |
| 2.268229895891829 | 1.031 | 1.19 | 1.457 |
| 2.271371488545418 | 1.031 | 1.189 | 1.452 |
| 2.274513081199008 | 1.03 | 1.187 | 1.448 |
| 2.277654673852597 | 1.03 | 1.186 | 1.444 |
| 2.280796266506186 | 1.03 | 1.185 | 1.44 |
| 2.283937859159776 | 1.03 | 1.183 | 1.436 |
| 2.287079451813366 | 1.03 | 1.182 | 1.432 |
| 2.290221044466955 | 1.03 | 1.181 | 1.427 |
| 2.293362637120545 | 1.029 | 1.18 | 1.423 |
| 2.296504229774135 | 1.029 | 1.178 | 1.419 |
| 2.299645822427724 | 1.029 | 1.177 | 1.415 |
| 2.302787415081314 | 1.029 | 1.176 | 1.411 |
| 2.305929007734904 | 1.029 | 1.175 | 1.407 |
| 2.309070600388493 | 1.029 | 1.173 | 1.404 |
| 2.312212193042083 | 1.028 | 1.172 | 1.4 |
| 2.315353785695672 | 1.028 | 1.171 | 1.396 |
| 2.318495378349262 | 1.028 | 1.169 | 1.392 |
| 2.321636971002852 | 1.028 | 1.168 | 1.388 |
| 2.324778563656441 | 1.028 | 1.167 | 1.384 |
| 2.327920156310031 | 1.028 | 1.166 | 1.381 |
| 2.33106174896362 | 1.027 | 1.164 | 1.377 |
| 2.33420334161721 | 1.027 | 1.163 | 1.373 |
| 2.3373449342708 | 1.027 | 1.162 | 1.37 |
| 2.340486526924389 | 1.027 | 1.161 | 1.366 |
| 2.343628119577979 | 1.027 | 1.16 | 1.362 |
| 2.346769712231568 | 1.026 | 1.158 | 1.359 |
| 2.349911304885158 | 1.026 | 1.157 | 1.355 |
| 2.353052897538748 | 1.026 | 1.156 | 1.352 |
| 2.356194490192337 | 1.026 | 1.155 | 1.348 |
| 2.359336082845927 | 1.026 | 1.153 | 1.345 |
| 2.362477675499516 | 1.026 | 1.152 | 1.342 |
| 2.365619268153106 | 1.025 | 1.151 | 1.338 |
| 2.368760860806696 | 1.025 | 1.15 | 1.335 |
| 2.371902453460285 | 1.025 | 1.149 | 1.331 |
| 2.375044046113875 | 1.025 | 1.148 | 1.328 |
| 2.378185638767464 | 1.025 | 1.146 | 1.325 |
| 2.381327231421054 | 1.025 | 1.145 | 1.322 |
| 2.384468824074644 | 1.024 | 1.144 | 1.318 |
| 2.387610416728233 | 1.024 | 1.143 | 1.315 |
| 2.390752009381823 | 1.024 | 1.142 | 1.312 |
| 2.393893602035412 | 1.024 | 1.14 | 1.309 |
| 2.397035194689002 | 1.024 | 1.139 | 1.306 |
| 2.400176787342591 | 1.024 | 1.138 | 1.302 |
| 2.403318379996181 | 1.023 | 1.137 | 1.299 |
| 2.406459972649771 | 1.023 | 1.136 | 1.296 |
| 2.40960156530336 | 1.023 | 1.135 | 1.293 |
| 2.41274315795695 | 1.023 | 1.134 | 1.29 |
| 2.41588475061054 | 1.023 | 1.132 | 1.287 |
| 2.419026343264129 | 1.023 | 1.131 | 1.284 |
| 2.422167935917719 | 1.022 | 1.13 | 1.281 |
| 2.425309528571308 | 1.022 | 1.129 | 1.278 |
| 2.428451121224898 | 1.022 | 1.128 | 1.275 |
| 2.431592713878488 | 1.022 | 1.127 | 1.272 |
| 2.434734306532077 | 1.022 | 1.126 | 1.27 |
| 2.437875899185667 | 1.022 | 1.125 | 1.267 |
| 2.441017491839256 | 1.021 | 1.124 | 1.264 |
| 2.444159084492846 | 1.021 | 1.122 | 1.261 |
| 2.447300677146435 | 1.021 | 1.121 | 1.258 |
| 2.450442269800025 | 1.021 | 1.12 | 1.256 |
| 2.453583862453615 | 1.021 | 1.119 | 1.253 |
| 2.456725455107204 | 1.021 | 1.118 | 1.25 |
| 2.459867047760794 | 1.02 | 1.117 | 1.247 |
| 2.463008640414384 | 1.02 | 1.116 | 1.245 |
| 2.466150233067973 | 1.02 | 1.115 | 1.242 |
| 2.469291825721563 | 1.02 | 1.114 | 1.239 |
| 2.472433418375152 | 1.02 | 1.113 | 1.237 |
| 2.475575011028742 | 1.02 | 1.112 | 1.234 |
| 2.478716603682332 | 1.019 | 1.111 | 1.232 |
| 2.481858196335921 | 1.019 | 1.11 | 1.229 |
| 2.48499978898951 | 1.019 | 1.109 | 1.227 |
| 2.4881413816431 | 1.019 | 1.108 | 1.224 |
| 2.49128297429669 | 1.019 | 1.107 | 1.222 |
| 2.49442456695028 | 1.019 | 1.106 | 1.219 |
| 2.497566159603869 | 1.019 | 1.104 | 1.217 |
| 2.500707752257458 | 1.018 | 1.103 | 1.214 |
| 2.503849344911048 | 1.018 | 1.102 | 1.212 |
| 2.506990937564638 | 1.018 | 1.101 | 1.209 |
| 2.510132530218228 | 1.018 | 1.1 | 1.207 |
| 2.513274122871817 | 1.018 | 1.099 | 1.205 |
| 2.516415715525407 | 1.018 | 1.098 | 1.202 |
| 2.519557308178996 | 1.017 | 1.097 | 1.2 |
| 2.522698900832586 | 1.017 | 1.097 | 1.198 |
| 2.525840493486176 | 1.017 | 1.096 | 1.195 |
| 2.528982086139765 | 1.017 | 1.095 | 1.193 |
| 2.532123678793355 | 1.017 | 1.094 | 1.191 |
| 2.535265271446944 | 1.017 | 1.093 | 1.189 |
| 2.538406864100534 | 1.016 | 1.092 | 1.186 |
| 2.541548456754124 | 1.016 | 1.091 | 1.184 |
| 2.544690049407713 | 1.016 | 1.09 | 1.182 |
| 2.547831642061302 | 1.016 | 1.089 | 1.18 |
| 2.550973234714892 | 1.016 | 1.088 | 1.178 |
| 2.554114827368482 | 1.016 | 1.087 | 1.176 |
| 2.557256420022072 | 1.016 | 1.086 | 1.174 |
| 2.560398012675661 | 1.015 | 1.085 | 1.171 |
| 2.563539605329251 | 1.015 | 1.084 | 1.169 |
| 2.56668119798284 | 1.015 | 1.083 | 1.167 |
| 2.56982279063643 | 1.015 | 1.082 | 1.165 |
| 2.57296438329002 | 1.015 | 1.081 | 1.163 |
| 2.576105975943609 | 1.015 | 1.081 | 1.161 |
| 2.579247568597199 | 1.015 | 1.08 | 1.159 |
| 2.582389161250788 | 1.014 | 1.079 | 1.157 |
| 2.585530753904377 | 1.014 | 1.078 | 1.155 |
| 2.588672346557967 | 1.014 | 1.077 | 1.153 |
| 2.591813939211557 | 1.014 | 1.076 | 1.151 |
| 2.594955531865147 | 1.014 | 1.075 | 1.149 |
| 2.598097124518736 | 1.014 | 1.074 | 1.148 |
| 2.601238717172326 | 1.014 | 1.074 | 1.146 |
| 2.604380309825915 | 1.013 | 1.073 | 1.144 |
| 2.607521902479505 | 1.013 | 1.072 | 1.142 |
| 2.610663495133095 | 1.013 | 1.071 | 1.14 |
| 2.613805087786684 | 1.013 | 1.07 | 1.138 |
| 2.616946680440274 | 1.013 | 1.069 | 1.137 |
| 2.620088273093863 | 1.013 | 1.068 | 1.135 |
| 2.623229865747452 | 1.013 | 1.068 | 1.133 |
| 2.626371458401042 | 1.012 | 1.067 | 1.131 |
| 2.629513051054632 | 1.012 | 1.066 | 1.129 |
| 2.632654643708222 | 1.012 | 1.065 | 1.128 |
| 2.635796236361811 | 1.012 | 1.064 | 1.126 |
| 2.638937829015401 | 1.012 | 1.064 | 1.124 |
| 2.642079421668991 | 1.012 | 1.063 | 1.123 |
| 2.64522101432258 | 1.012 | 1.062 | 1.121 |
| 2.64836260697617 | 1.011 | 1.061 | 1.119 |
| 2.651504199629759 | 1.011 | 1.06 | 1.118 |
| 2.654645792283349 | 1.011 | 1.06 | 1.116 |
| 2.657787384936938 | 1.011 | 1.059 | 1.114 |
| 2.660928977590528 | 1.011 | 1.058 | 1.113 |
| 2.664070570244118 | 1.011 | 1.057 | 1.111 |
| 2.667212162897707 | 1.011 | 1.057 | 1.11 |
| 2.670353755551297 | 1.01 | 1.056 | 1.108 |
| 2.673495348204887 | 1.01 | 1.055 | 1.106 |
| 2.676636940858476 | 1.01 | 1.054 | 1.105 |
| 2.679778533512066 | 1.01 | 1.054 | 1.103 |
| 2.682920126165655 | 1.01 | 1.053 | 1.102 |
| 2.686061718819245 | 1.01 | 1.052 | 1.1 |
| 2.689203311472835 | 1.01 | 1.051 | 1.099 |
| 2.692344904126424 | 1.01 | 1.051 | 1.097 |
| 2.695486496780014 | 1.009 | 1.05 | 1.096 |
| 2.698628089433603 | 1.009 | 1.049 | 1.095 |
| 2.701769682087193 | 1.009 | 1.049 | 1.093 |
| 2.704911274740782 | 1.009 | 1.048 | 1.092 |
| 2.708052867394372 | 1.009 | 1.047 | 1.09 |
| 2.711194460047962 | 1.009 | 1.047 | 1.089 |
| 2.714336052701551 | 1.009 | 1.046 | 1.088 |
| 2.717477645355141 | 1.009 | 1.045 | 1.086 |
| 2.720619238008731 | 1.008 | 1.045 | 1.085 |
| 2.72376083066232 | 1.008 | 1.044 | 1.084 |
| 2.72690242331591 | 1.008 | 1.043 | 1.082 |
| 2.730044015969499 | 1.008 | 1.043 | 1.081 |
| 2.733185608623089 | 1.008 | 1.042 | 1.08 |
| 2.736327201276678 | 1.008 | 1.041 | 1.078 |
| 2.739468793930268 | 1.008 | 1.041 | 1.077 |
| 2.742610386583858 | 1.008 | 1.04 | 1.076 |
| 2.745751979237447 | 1.008 | 1.039 | 1.074 |
| 2.748893571891036 | 1.007 | 1.039 | 1.073 |
| 2.752035164544627 | 1.007 | 1.038 | 1.072 |
| 2.755176757198216 | 1.007 | 1.038 | 1.071 |
| 2.758318349851806 | 1.007 | 1.037 | 1.07 |
| 2.761459942505395 | 1.007 | 1.036 | 1.068 |
| 2.764601535158985 | 1.007 | 1.036 | 1.067 |
| 2.767743127812574 | 1.007 | 1.035 | 1.066 |
| 2.770884720466164 | 1.007 | 1.035 | 1.065 |
| 2.774026313119754 | 1.007 | 1.034 | 1.064 |
| 2.777167905773343 | 1.006 | 1.033 | 1.063 |
| 2.780309498426932 | 1.006 | 1.033 | 1.061 |
| 2.783451091080522 | 1.006 | 1.032 | 1.06 |
| 2.786592683734112 | 1.006 | 1.032 | 1.059 |
| 2.789734276387701 | 1.006 | 1.031 | 1.058 |
| 2.792875869041291 | 1.006 | 1.031 | 1.057 |
| 2.796017461694881 | 1.006 | 1.03 | 1.056 |
| 2.79915905434847 | 1.006 | 1.029 | 1.055 |
| 2.80230064700206 | 1.006 | 1.029 | 1.054 |
| 2.80544223965565 | 1.005 | 1.028 | 1.053 |
| 2.808583832309239 | 1.005 | 1.028 | 1.052 |
| 2.811725424962829 | 1.005 | 1.027 | 1.051 |
| 2.814867017616419 | 1.005 | 1.027 | 1.05 |
| 2.818008610270008 | 1.005 | 1.026 | 1.049 |
| 2.821150202923598 | 1.005 | 1.026 | 1.048 |
| 2.824291795577187 | 1.005 | 1.025 | 1.047 |
| 2.827433388230777 | 1.005 | 1.025 | 1.046 |
| 2.830574980884366 | 1.005 | 1.024 | 1.045 |
| 2.833716573537956 | 1.005 | 1.024 | 1.044 |
| 2.836858166191546 | 1.005 | 1.023 | 1.043 |
| 2.839999758845135 | 1.004 | 1.023 | 1.042 |
| 2.843141351498725 | 1.004 | 1.022 | 1.041 |
| 2.846282944152314 | 1.004 | 1.022 | 1.04 |
| 2.849424536805904 | 1.004 | 1.021 | 1.04 |
| 2.852566129459494 | 1.004 | 1.021 | 1.039 |
| 2.855707722113083 | 1.004 | 1.02 | 1.038 |
| 2.858849314766673 | 1.004 | 1.02 | 1.037 |
| 2.861990907420262 | 1.004 | 1.02 | 1.036 |
| 2.865132500073852 | 1.004 | 1.019 | 1.035 |
| 2.868274092727442 | 1.004 | 1.019 | 1.034 |
| 2.871415685381031 | 1.004 | 1.018 | 1.034 |
| 2.874557278034621 | 1.003 | 1.018 | 1.033 |
| 2.87769887068821 | 1.003 | 1.017 | 1.032 |
| 2.8808404633418 | 1.003 | 1.017 | 1.031 |
| 2.88398205599539 | 1.003 | 1.017 | 1.031 |
| 2.88712364864898 | 1.003 | 1.016 | 1.03 |
| 2.890265241302569 | 1.003 | 1.016 | 1.029 |
| 2.893406833956158 | 1.003 | 1.015 | 1.028 |
| 2.896548426609748 | 1.003 | 1.015 | 1.028 |
| 2.899690019263338 | 1.003 | 1.015 | 1.027 |
| 2.902831611916927 | 1.003 | 1.014 | 1.026 |
| 2.905973204570517 | 1.003 | 1.014 | 1.025 |
| 2.909114797224106 | 1.003 | 1.014 | 1.025 |
| 2.912256389877696 | 1.003 | 1.013 | 1.024 |
| 2.915397982531286 | 1.003 | 1.013 | 1.023 |
| 2.918539575184875 | 1.002 | 1.012 | 1.023 |
| 2.921681167838465 | 1.002 | 1.012 | 1.022 |
| 2.924822760492054 | 1.002 | 1.012 | 1.021 |
| 2.927964353145644 | 1.002 | 1.011 | 1.021 |
| 2.931105945799234 | 1.002 | 1.011 | 1.02 |
| 2.934247538452823 | 1.002 | 1.011 | 1.02 |
| 2.937389131106413 | 1.002 | 1.01 | 1.019 |
| 2.940530723760002 | 1.002 | 1.01 | 1.018 |
| 2.943672316413592 | 1.002 | 1.01 | 1.018 |
| 2.946813909067182 | 1.002 | 1.009 | 1.017 |
| 2.949955501720771 | 1.002 | 1.009 | 1.017 |
| 2.953097094374361 | 1.002 | 1.009 | 1.016 |
| 2.95623868702795 | 1.002 | 1.009 | 1.016 |
| 2.95938027968154 | 1.002 | 1.008 | 1.015 |
| 2.96252187233513 | 1.002 | 1.008 | 1.015 |
| 2.965663464988719 | 1.002 | 1.008 | 1.014 |
| 2.968805057642309 | 1.001 | 1.007 | 1.014 |
| 2.971946650295898 | 1.001 | 1.007 | 1.013 |
| 2.975088242949488 | 1.001 | 1.007 | 1.013 |
| 2.978229835603078 | 1.001 | 1.007 | 1.012 |
| 2.981371428256667 | 1.001 | 1.006 | 1.012 |
| 2.984513020910257 | 1.001 | 1.006 | 1.011 |
| 2.987654613563846 | 1.001 | 1.006 | 1.011 |
| 2.990796206217436 | 1.001 | 1.006 | 1.01 |
| 2.993937798871025 | 1.001 | 1.005 | 1.01 |
| 2.997079391524615 | 1.001 | 1.005 | 1.009 |
| 3.000220984178205 | 1.001 | 1.005 | 1.009 |
| 3.003362576831794 | 1.001 | 1.005 | 1.009 |
| 3.006504169485384 | 1.001 | 1.005 | 1.008 |
| 3.009645762138974 | 1.001 | 1.004 | 1.008 |
| 3.012787354792563 | 1.001 | 1.004 | 1.008 |
| 3.015928947446153 | 1.001 | 1.004 | 1.007 |
| 3.019070540099742 | 1.001 | 1.004 | 1.007 |
| 3.022212132753332 | 1.001 | 1.004 | 1.006 |
| 3.025353725406922 | 1.001 | 1.003 | 1.006 |
| 3.028495318060511 | 1.001 | 1.003 | 1.006 |
| 3.031636910714101 | 1.001 | 1.003 | 1.005 |
| 3.03477850336769 | 1.001 | 1.003 | 1.005 |
| 3.03792009602128 | 1.001 | 1.003 | 1.005 |
| 3.04106168867487 | 1.001 | 1.003 | 1.005 |
| 3.04420328132846 | 1 | 1.002 | 1.004 |
| 3.047344873982049 | 1 | 1.002 | 1.004 |
| 3.050486466635638 | 1 | 1.002 | 1.004 |
| 3.053628059289228 | 1 | 1.002 | 1.003 |
| 3.056769651942818 | 1 | 1.002 | 1.003 |
| 3.059911244596407 | 1 | 1.002 | 1.003 |
| 3.063052837249997 | 1 | 1.002 | 1.003 |
| 3.066194429903586 | 1 | 1.001 | 1.003 |
| 3.069336022557176 | 1 | 1.001 | 1.002 |
| 3.072477615210766 | 1 | 1.001 | 1.002 |
| 3.075619207864355 | 1 | 1.001 | 1.002 |
| 3.078760800517945 | 1 | 1.001 | 1.002 |
| 3.081902393171534 | 1 | 1.001 | 1.002 |
| 3.085043985825124 | 1 | 1.001 | 1.001 |
| 3.088185578478713 | 1 | 1.001 | 1.001 |
| 3.091327171132303 | 1 | 1.001 | 1.001 |
| 3.094468763785893 | 1 | 1.001 | 1.001 |
| 3.097610356439482 | 1 | 1 | 1.001 |
| 3.100751949093072 | 1 | 1 | 1.001 |
| 3.103893541746661 | 1 | 1 | 1.001 |
| 3.107035134400251 | 1 | 1 | 1.001 |
| 3.110176727053841 | 1 | 1 | 1 |
| 3.11331831970743 | 1 | 1 | 1 |
| 3.11645991236102 | 1 | 1 | 1 |
| 3.11960150501461 | 1 | 1 | 1 |
| 3.122743097668199 | 1 | 1 | 1 |
| 3.125884690321789 | 1 | 1 | 1 |
| 3.129026282975378 | 1 | 1 | 1 |
| 3.132167875628968 | 1 | 1 | 1 |
| 3.135309468282557 | 1 | 1 | 1 |
| 3.138451060936147 | 1 | 1 | 1 |
| 3.141592653589737 | 1 | 1 | 1 |
| 3.144734246243326 | 1 | 1 | 1 |
| 3.147875838896916 | 1 | 1 | 1 |
| 3.151017431550505 | 1 | 1 | 1 |
| 3.154159024204095 | 1 | 1 | 1 |
| 3.157300616857685 | 1 | 1 | 1 |
| 3.160442209511274 | 1 | 1 | 1 |
| 3.163583802164864 | 1 | 1 | 1 |
| 3.166725394818453 | 1 | 1 | 1 |
| 3.169866987472043 | 1 | 1 | 1 |
| 3.173008580125633 | 1 | 1 | 1 |
| 3.176150172779222 | 1 | 1 | 1.001 |
| 3.179291765432812 | 1 | 1 | 1.001 |
| 3.182433358086401 | 1 | 1 | 1.001 |
| 3.185574950739991 | 1 | 1 | 1.001 |
| 3.188716543393581 | 1 | 1.001 | 1.001 |
| 3.19185813604717 | 1 | 1.001 | 1.001 |
| 3.19499972870076 | 1 | 1.001 | 1.001 |
| 3.198141321354349 | 1 | 1.001 | 1.001 |
| 3.20128291400794 | 1 | 1.001 | 1.002 |
| 3.204424506661528 | 1 | 1.001 | 1.002 |
| 3.207566099315118 | 1 | 1.001 | 1.002 |
| 3.210707691968708 | 1 | 1.001 | 1.002 |
| 3.213849284622297 | 1 | 1.001 | 1.002 |
| 3.216990877275887 | 1 | 1.001 | 1.003 |
| 3.220132469929476 | 1 | 1.002 | 1.003 |
| 3.223274062583066 | 1 | 1.002 | 1.003 |
| 3.226415655236656 | 1 | 1.002 | 1.003 |
| 3.229557247890245 | 1 | 1.002 | 1.003 |
| 3.232698840543835 | 1 | 1.002 | 1.004 |
| 3.235840433197425 | 1 | 1.002 | 1.004 |
| 3.238982025851014 | 1 | 1.002 | 1.004 |
| 3.242123618504604 | 1.001 | 1.003 | 1.005 |
| 3.245265211158193 | 1.001 | 1.003 | 1.005 |
| 3.248406803811783 | 1.001 | 1.003 | 1.005 |
| 3.251548396465373 | 1.001 | 1.003 | 1.005 |
| 3.254689989118962 | 1.001 | 1.003 | 1.006 |
| 3.257831581772551 | 1.001 | 1.003 | 1.006 |
| 3.260973174426141 | 1.001 | 1.004 | 1.006 |
| 3.26411476707973 | 1.001 | 1.004 | 1.007 |
| 3.267256359733321 | 1.001 | 1.004 | 1.007 |
| 3.27039795238691 | 1.001 | 1.004 | 1.008 |
| 3.2735395450405 | 1.001 | 1.004 | 1.008 |
| 3.276681137694089 | 1.001 | 1.005 | 1.008 |
| 3.279822730347679 | 1.001 | 1.005 | 1.009 |
| 3.282964323001269 | 1.001 | 1.005 | 1.009 |
| 3.286105915654858 | 1.001 | 1.005 | 1.009 |
| 3.289247508308448 | 1.001 | 1.005 | 1.01 |
| 3.292389100962037 | 1.001 | 1.006 | 1.01 |
| 3.295530693615627 | 1.001 | 1.006 | 1.011 |
| 3.298672286269217 | 1.001 | 1.006 | 1.011 |
| 3.301813878922806 | 1.001 | 1.006 | 1.012 |
| 3.304955471576396 | 1.001 | 1.007 | 1.012 |
| 3.308097064229985 | 1.001 | 1.007 | 1.013 |
| 3.311238656883575 | 1.001 | 1.007 | 1.013 |
| 3.314380249537165 | 1.001 | 1.007 | 1.014 |
| 3.317521842190754 | 1.002 | 1.008 | 1.014 |
| 3.320663434844344 | 1.002 | 1.008 | 1.015 |
| 3.323805027497933 | 1.002 | 1.008 | 1.015 |
| 3.326946620151523 | 1.002 | 1.009 | 1.016 |
| 3.330088212805113 | 1.002 | 1.009 | 1.016 |
| 3.333229805458702 | 1.002 | 1.009 | 1.017 |
| 3.336371398112292 | 1.002 | 1.009 | 1.017 |
| 3.339512990765881 | 1.002 | 1.01 | 1.018 |
| 3.342654583419471 | 1.002 | 1.01 | 1.018 |
| 3.345796176073061 | 1.002 | 1.01 | 1.019 |
| 3.34893776872665 | 1.002 | 1.011 | 1.02 |
| 3.35207936138024 | 1.002 | 1.011 | 1.02 |
| 3.355220954033829 | 1.002 | 1.011 | 1.021 |
| 3.358362546687419 | 1.002 | 1.012 | 1.021 |
| 3.361504139341009 | 1.002 | 1.012 | 1.022 |
| 3.364645731994598 | 1.002 | 1.012 | 1.023 |
| 3.367787324648188 | 1.003 | 1.013 | 1.023 |
| 3.370928917301777 | 1.003 | 1.013 | 1.024 |
| 3.374070509955367 | 1.003 | 1.014 | 1.025 |
| 3.377212102608956 | 1.003 | 1.014 | 1.025 |
| 3.380353695262546 | 1.003 | 1.014 | 1.026 |
| 3.383495287916136 | 1.003 | 1.015 | 1.027 |
| 3.386636880569725 | 1.003 | 1.015 | 1.028 |
| 3.389778473223315 | 1.003 | 1.015 | 1.028 |
| 3.392920065876904 | 1.003 | 1.016 | 1.029 |
| 3.396061658530494 | 1.003 | 1.016 | 1.03 |
| 3.399203251184084 | 1.003 | 1.017 | 1.031 |
| 3.402344843837673 | 1.003 | 1.017 | 1.031 |
| 3.405486436491263 | 1.003 | 1.017 | 1.032 |
| 3.408628029144852 | 1.003 | 1.018 | 1.033 |
| 3.411769621798442 | 1.004 | 1.018 | 1.034 |
| 3.414911214452032 | 1.004 | 1.019 | 1.034 |
| 3.418052807105621 | 1.004 | 1.019 | 1.035 |
| 3.421194399759211 | 1.004 | 1.02 | 1.036 |
| 3.4243359924128 | 1.004 | 1.02 | 1.037 |
| 3.42747758506639 | 1.004 | 1.02 | 1.038 |
| 3.43061917771998 | 1.004 | 1.021 | 1.039 |
| 3.433760770373569 | 1.004 | 1.021 | 1.04 |
| 3.436902363027159 | 1.004 | 1.022 | 1.04 |
| 3.440043955680748 | 1.004 | 1.022 | 1.041 |
| 3.443185548334338 | 1.004 | 1.023 | 1.042 |
| 3.446327140987927 | 1.005 | 1.023 | 1.043 |
| 3.449468733641517 | 1.005 | 1.024 | 1.044 |
| 3.452610326295107 | 1.005 | 1.024 | 1.045 |
| 3.455751918948696 | 1.005 | 1.025 | 1.046 |
| 3.458893511602286 | 1.005 | 1.025 | 1.047 |
| 3.462035104255876 | 1.005 | 1.026 | 1.048 |
| 3.465176696909465 | 1.005 | 1.026 | 1.049 |
| 3.468318289563055 | 1.005 | 1.027 | 1.05 |
| 3.471459882216644 | 1.005 | 1.027 | 1.051 |
| 3.474601474870234 | 1.005 | 1.028 | 1.052 |
| 3.477743067523824 | 1.005 | 1.028 | 1.053 |
| 3.480884660177413 | 1.006 | 1.029 | 1.054 |
| 3.484026252831002 | 1.006 | 1.029 | 1.055 |
| 3.487167845484592 | 1.006 | 1.03 | 1.056 |
| 3.490309438138182 | 1.006 | 1.031 | 1.057 |
| 3.493451030791772 | 1.006 | 1.031 | 1.058 |
| 3.496592623445361 | 1.006 | 1.032 | 1.059 |
| 3.499734216098951 | 1.006 | 1.032 | 1.06 |
| 3.50287580875254 | 1.006 | 1.033 | 1.061 |
| 3.50601740140613 | 1.006 | 1.033 | 1.063 |
| 3.50915899405972 | 1.007 | 1.034 | 1.064 |
| 3.512300586713309 | 1.007 | 1.035 | 1.065 |
| 3.515442179366899 | 1.007 | 1.035 | 1.066 |
| 3.518583772020488 | 1.007 | 1.036 | 1.067 |
| 3.521725364674078 | 1.007 | 1.036 | 1.068 |
| 3.524866957327668 | 1.007 | 1.037 | 1.07 |
| 3.528008549981257 | 1.007 | 1.038 | 1.071 |
| 3.531150142634847 | 1.007 | 1.038 | 1.072 |
| 3.534291735288436 | 1.007 | 1.039 | 1.073 |
| 3.537433327942026 | 1.008 | 1.039 | 1.074 |
| 3.540574920595616 | 1.008 | 1.04 | 1.076 |
| 3.543716513249205 | 1.008 | 1.041 | 1.077 |
| 3.546858105902795 | 1.008 | 1.041 | 1.078 |
| 3.549999698556384 | 1.008 | 1.042 | 1.08 |
| 3.553141291209974 | 1.008 | 1.043 | 1.081 |
| 3.556282883863564 | 1.008 | 1.043 | 1.082 |
| 3.559424476517153 | 1.008 | 1.044 | 1.084 |
| 3.562566069170743 | 1.008 | 1.045 | 1.085 |
| 3.565707661824332 | 1.009 | 1.045 | 1.086 |
| 3.568849254477922 | 1.009 | 1.046 | 1.088 |
| 3.571990847131511 | 1.009 | 1.047 | 1.089 |
| 3.575132439785101 | 1.009 | 1.047 | 1.09 |
| 3.578274032438691 | 1.009 | 1.048 | 1.092 |
| 3.58141562509228 | 1.009 | 1.049 | 1.093 |
| 3.58455721774587 | 1.009 | 1.049 | 1.095 |
| 3.58769881039946 | 1.009 | 1.05 | 1.096 |
| 3.590840403053049 | 1.01 | 1.051 | 1.097 |
| 3.593981995706639 | 1.01 | 1.051 | 1.099 |
| 3.597123588360228 | 1.01 | 1.052 | 1.1 |
| 3.600265181013818 | 1.01 | 1.053 | 1.102 |
| 3.603406773667407 | 1.01 | 1.054 | 1.103 |
| 3.606548366320997 | 1.01 | 1.054 | 1.105 |
| 3.609689958974587 | 1.01 | 1.055 | 1.106 |
| 3.612831551628176 | 1.01 | 1.056 | 1.108 |
| 3.615973144281766 | 1.011 | 1.057 | 1.11 |
| 3.619114736935355 | 1.011 | 1.057 | 1.111 |
| 3.622256329588945 | 1.011 | 1.058 | 1.113 |
| 3.625397922242534 | 1.011 | 1.059 | 1.114 |
| 3.628539514896124 | 1.011 | 1.06 | 1.116 |
| 3.631681107549714 | 1.011 | 1.06 | 1.118 |
| 3.634822700203303 | 1.011 | 1.061 | 1.119 |
| 3.637964292856893 | 1.012 | 1.062 | 1.121 |
| 3.641105885510483 | 1.012 | 1.063 | 1.123 |
| 3.644247478164072 | 1.012 | 1.064 | 1.124 |
| 3.647389070817662 | 1.012 | 1.064 | 1.126 |
| 3.650530663471251 | 1.012 | 1.065 | 1.128 |
| 3.653672256124841 | 1.012 | 1.066 | 1.129 |
| 3.656813848778431 | 1.012 | 1.067 | 1.131 |
| 3.65995544143202 | 1.013 | 1.068 | 1.133 |
| 3.66309703408561 | 1.013 | 1.068 | 1.135 |
| 3.666238626739199 | 1.013 | 1.069 | 1.137 |
| 3.66938021939279 | 1.013 | 1.07 | 1.138 |
| 3.672521812046378 | 1.013 | 1.071 | 1.14 |
| 3.675663404699968 | 1.013 | 1.072 | 1.142 |
| 3.678804997353558 | 1.013 | 1.073 | 1.144 |
| 3.681946590007147 | 1.014 | 1.074 | 1.146 |
| 3.685088182660737 | 1.014 | 1.074 | 1.148 |
| 3.688229775314326 | 1.014 | 1.075 | 1.149 |
| 3.691371367967916 | 1.014 | 1.076 | 1.151 |
| 3.694512960621506 | 1.014 | 1.077 | 1.153 |
| 3.697654553275095 | 1.014 | 1.078 | 1.155 |
| 3.700796145928685 | 1.014 | 1.079 | 1.157 |
| 3.703937738582274 | 1.015 | 1.08 | 1.159 |
| 3.707079331235864 | 1.015 | 1.081 | 1.161 |
| 3.710220923889454 | 1.015 | 1.081 | 1.163 |
| 3.713362516543043 | 1.015 | 1.082 | 1.165 |
| 3.716504109196633 | 1.015 | 1.083 | 1.167 |
| 3.719645701850223 | 1.015 | 1.084 | 1.169 |
| 3.722787294503812 | 1.015 | 1.085 | 1.171 |
| 3.725928887157402 | 1.016 | 1.086 | 1.174 |
| 3.729070479810991 | 1.016 | 1.087 | 1.176 |
| 3.732212072464581 | 1.016 | 1.088 | 1.178 |
| 3.735353665118171 | 1.016 | 1.089 | 1.18 |
| 3.73849525777176 | 1.016 | 1.09 | 1.182 |
| 3.74163685042535 | 1.016 | 1.091 | 1.184 |
| 3.744778443078939 | 1.016 | 1.092 | 1.186 |
| 3.747920035732529 | 1.017 | 1.093 | 1.189 |
| 3.751061628386119 | 1.017 | 1.094 | 1.191 |
| 3.754203221039708 | 1.017 | 1.095 | 1.193 |
| 3.757344813693298 | 1.017 | 1.096 | 1.195 |
| 3.760486406346887 | 1.017 | 1.097 | 1.198 |
| 3.763627999000477 | 1.017 | 1.097 | 1.2 |
| 3.766769591654067 | 1.018 | 1.098 | 1.202 |
| 3.769911184307656 | 1.018 | 1.099 | 1.205 |
| 3.773052776961246 | 1.018 | 1.1 | 1.207 |
| 3.776194369614835 | 1.018 | 1.101 | 1.209 |
| 3.779335962268425 | 1.018 | 1.102 | 1.212 |
| 3.782477554922014 | 1.018 | 1.103 | 1.214 |
| 3.785619147575604 | 1.019 | 1.104 | 1.217 |
| 3.788760740229193 | 1.019 | 1.106 | 1.219 |
| 3.791902332882783 | 1.019 | 1.107 | 1.222 |
| 3.795043925536373 | 1.019 | 1.108 | 1.224 |
| 3.798185518189962 | 1.019 | 1.109 | 1.227 |
| 3.801327110843552 | 1.019 | 1.11 | 1.229 |
| 3.804468703497142 | 1.019 | 1.111 | 1.232 |
| 3.807610296150731 | 1.02 | 1.112 | 1.234 |
| 3.810751888804321 | 1.02 | 1.113 | 1.237 |
| 3.813893481457911 | 1.02 | 1.114 | 1.239 |
| 3.8170350741115 | 1.02 | 1.115 | 1.242 |
| 3.82017666676509 | 1.02 | 1.116 | 1.245 |
| 3.823318259418679 | 1.02 | 1.117 | 1.247 |
| 3.826459852072269 | 1.021 | 1.118 | 1.25 |
| 3.829601444725859 | 1.021 | 1.119 | 1.253 |
| 3.832743037379448 | 1.021 | 1.12 | 1.256 |
| 3.835884630033038 | 1.021 | 1.121 | 1.258 |
| 3.839026222686627 | 1.021 | 1.122 | 1.261 |
| 3.842167815340217 | 1.021 | 1.124 | 1.264 |
| 3.845309407993807 | 1.022 | 1.125 | 1.267 |
| 3.848451000647396 | 1.022 | 1.126 | 1.27 |
| 3.851592593300986 | 1.022 | 1.127 | 1.272 |
| 3.854734185954575 | 1.022 | 1.128 | 1.275 |
| 3.857875778608165 | 1.022 | 1.129 | 1.278 |
| 3.861017371261755 | 1.022 | 1.13 | 1.281 |
| 3.864158963915344 | 1.023 | 1.131 | 1.284 |
| 3.867300556568933 | 1.023 | 1.132 | 1.287 |
| 3.870442149222523 | 1.023 | 1.134 | 1.29 |
| 3.873583741876112 | 1.023 | 1.135 | 1.293 |
| 3.876725334529703 | 1.023 | 1.136 | 1.296 |
| 3.879866927183292 | 1.023 | 1.137 | 1.299 |
| 3.883008519836882 | 1.024 | 1.138 | 1.302 |
| 3.886150112490471 | 1.024 | 1.139 | 1.306 |
| 3.889291705144061 | 1.024 | 1.14 | 1.309 |
| 3.892433297797651 | 1.024 | 1.142 | 1.312 |
| 3.89557489045124 | 1.024 | 1.143 | 1.315 |
| 3.89871648310483 | 1.024 | 1.144 | 1.318 |
| 3.901858075758419 | 1.025 | 1.145 | 1.322 |
| 3.904999668412009 | 1.025 | 1.146 | 1.325 |
| 3.908141261065598 | 1.025 | 1.148 | 1.328 |
| 3.911282853719188 | 1.025 | 1.149 | 1.331 |
| 3.914424446372778 | 1.025 | 1.15 | 1.335 |
| 3.917566039026367 | 1.025 | 1.151 | 1.338 |
| 3.920707631679957 | 1.026 | 1.152 | 1.342 |
| 3.923849224333547 | 1.026 | 1.153 | 1.345 |
| 3.926990816987136 | 1.026 | 1.155 | 1.348 |
| 3.930132409640726 | 1.026 | 1.156 | 1.352 |
| 3.933274002294315 | 1.026 | 1.157 | 1.355 |
| 3.936415594947905 | 1.026 | 1.158 | 1.359 |
| 3.939557187601495 | 1.027 | 1.16 | 1.362 |
| 3.942698780255084 | 1.027 | 1.161 | 1.366 |
| 3.945840372908674 | 1.027 | 1.162 | 1.37 |
| 3.948981965562263 | 1.027 | 1.163 | 1.373 |
| 3.952123558215853 | 1.027 | 1.164 | 1.377 |
| 3.955265150869442 | 1.028 | 1.166 | 1.381 |
| 3.958406743523032 | 1.028 | 1.167 | 1.384 |
| 3.961548336176622 | 1.028 | 1.168 | 1.388 |
| 3.964689928830211 | 1.028 | 1.169 | 1.392 |
| 3.967831521483801 | 1.028 | 1.171 | 1.396 |
| 3.97097311413739 | 1.028 | 1.172 | 1.4 |
| 3.97411470679098 | 1.029 | 1.173 | 1.404 |
| 3.97725629944457 | 1.029 | 1.175 | 1.407 |
| 3.98039789209816 | 1.029 | 1.176 | 1.411 |
| 3.983539484751749 | 1.029 | 1.177 | 1.415 |
| 3.986681077405338 | 1.029 | 1.178 | 1.419 |
| 3.989822670058928 | 1.029 | 1.18 | 1.423 |
| 3.992964262712517 | 1.03 | 1.181 | 1.427 |
| 3.996105855366107 | 1.03 | 1.182 | 1.432 |
| 3.999247448019697 | 1.03 | 1.183 | 1.436 |
| 4.002389040673287 | 1.03 | 1.185 | 1.44 |
| 4.005530633326877 | 1.03 | 1.186 | 1.444 |
| 4.008672225980466 | 1.03 | 1.187 | 1.448 |
| 4.011813818634056 | 1.031 | 1.189 | 1.452 |
| 4.014955411287645 | 1.031 | 1.19 | 1.457 |
| 4.018097003941234 | 1.031 | 1.191 | 1.461 |
| 4.021238596594824 | 1.031 | 1.193 | 1.465 |
| 4.024380189248414 | 1.031 | 1.194 | 1.47 |
| 4.027521781902004 | 1.031 | 1.195 | 1.474 |
| 4.030663374555593 | 1.032 | 1.196 | 1.479 |
| 4.033804967209183 | 1.032 | 1.198 | 1.483 |
| 4.036946559862773 | 1.032 | 1.199 | 1.488 |
| 4.040088152516362 | 1.032 | 1.2 | 1.492 |
| 4.043229745169951 | 1.032 | 1.202 | 1.497 |
| 4.046371337823541 | 1.032 | 1.203 | 1.501 |
| 4.049512930477131 | 1.033 | 1.204 | 1.506 |
| 4.05265452313072 | 1.033 | 1.206 | 1.511 |
| 4.05579611578431 | 1.033 | 1.207 | 1.516 |
| 4.0589377084379 | 1.033 | 1.208 | 1.52 |
| 4.062079301091489 | 1.033 | 1.21 | 1.525 |
| 4.065220893745079 | 1.033 | 1.211 | 1.53 |
| 4.068362486398668 | 1.034 | 1.212 | 1.535 |
| 4.071504079052258 | 1.034 | 1.214 | 1.54 |
| 4.074645671705848 | 1.034 | 1.215 | 1.545 |
| 4.077787264359437 | 1.034 | 1.216 | 1.55 |
| 4.080928857013027 | 1.034 | 1.218 | 1.555 |
| 4.084070449666616 | 1.034 | 1.219 | 1.56 |
| 4.087212042320206 | 1.035 | 1.221 | 1.565 |
| 4.090353634973795 | 1.035 | 1.222 | 1.57 |
| 4.093495227627385 | 1.035 | 1.223 | 1.575 |
| 4.096636820280975 | 1.035 | 1.225 | 1.581 |
| 4.099778412934564 | 1.035 | 1.226 | 1.586 |
| 4.102920005588154 | 1.035 | 1.227 | 1.591 |
| 4.106061598241744 | 1.036 | 1.229 | 1.597 |
| 4.109203190895333 | 1.036 | 1.23 | 1.602 |
| 4.112344783548923 | 1.036 | 1.231 | 1.608 |
| 4.115486376202512 | 1.036 | 1.233 | 1.613 |
| 4.118627968856102 | 1.036 | 1.234 | 1.619 |
| 4.121769561509692 | 1.036 | 1.236 | 1.624 |
| 4.124911154163281 | 1.037 | 1.237 | 1.63 |
| 4.128052746816871 | 1.037 | 1.238 | 1.635 |
| 4.13119433947046 | 1.037 | 1.24 | 1.641 |
| 4.13433593212405 | 1.037 | 1.241 | 1.647 |
| 4.13747752477764 | 1.037 | 1.242 | 1.653 |
| 4.14061911743123 | 1.037 | 1.244 | 1.659 |
| 4.143760710084818 | 1.038 | 1.245 | 1.664 |
| 4.146902302738408 | 1.038 | 1.247 | 1.67 |
| 4.150043895391998 | 1.038 | 1.248 | 1.676 |
| 4.153185488045588 | 1.038 | 1.249 | 1.682 |
| 4.156327080699177 | 1.038 | 1.251 | 1.688 |
| 4.159468673352766 | 1.038 | 1.252 | 1.695 |
| 4.162610266006356 | 1.038 | 1.253 | 1.701 |
| 4.165751858659946 | 1.039 | 1.255 | 1.707 |
| 4.168893451313535 | 1.039 | 1.256 | 1.713 |
| 4.172035043967125 | 1.039 | 1.258 | 1.72 |
| 4.175176636620715 | 1.039 | 1.259 | 1.726 |
| 4.178318229274304 | 1.039 | 1.26 | 1.732 |
| 4.181459821927894 | 1.039 | 1.262 | 1.739 |
| 4.184601414581484 | 1.04 | 1.263 | 1.745 |
| 4.187743007235073 | 1.04 | 1.264 | 1.752 |
| 4.190884599888663 | 1.04 | 1.266 | 1.759 |
| 4.194026192542252 | 1.04 | 1.267 | 1.765 |
| 4.197167785195842 | 1.04 | 1.269 | 1.772 |
| 4.200309377849432 | 1.04 | 1.27 | 1.779 |
| 4.203450970503021 | 1.04 | 1.271 | 1.786 |
| 4.206592563156611 | 1.041 | 1.273 | 1.792 |
| 4.2097341558102 | 1.041 | 1.274 | 1.799 |
| 4.21287574846379 | 1.041 | 1.275 | 1.806 |
| 4.21601734111738 | 1.041 | 1.277 | 1.813 |
| 4.21915893377097 | 1.041 | 1.278 | 1.82 |
| 4.222300526424559 | 1.041 | 1.28 | 1.828 |
| 4.225442119078148 | 1.041 | 1.281 | 1.835 |
| 4.228583711731738 | 1.042 | 1.282 | 1.842 |
| 4.231725304385327 | 1.042 | 1.284 | 1.849 |
| 4.234866897038917 | 1.042 | 1.285 | 1.857 |
| 4.238008489692506 | 1.042 | 1.286 | 1.864 |
| 4.241150082346096 | 1.042 | 1.288 | 1.872 |
| 4.244291674999685 | 1.042 | 1.289 | 1.879 |
| 4.247433267653276 | 1.043 | 1.29 | 1.887 |
| 4.250574860306865 | 1.043 | 1.292 | 1.894 |
| 4.253716452960455 | 1.043 | 1.293 | 1.902 |
| 4.256858045614044 | 1.043 | 1.294 | 1.91 |
| 4.259999638267634 | 1.043 | 1.296 | 1.918 |
| 4.263141230921224 | 1.043 | 1.297 | 1.925 |
| 4.266282823574813 | 1.043 | 1.299 | 1.933 |
| 4.269424416228403 | 1.043 | 1.3 | 1.941 |
| 4.272566008881992 | 1.044 | 1.301 | 1.949 |
| 4.275707601535582 | 1.044 | 1.303 | 1.957 |
| 4.27884919418917 | 1.044 | 1.304 | 1.966 |
| 4.28199078684276 | 1.044 | 1.305 | 1.974 |
| 4.285132379496351 | 1.044 | 1.306 | 1.982 |
| 4.28827397214994 | 1.044 | 1.308 | 1.99 |
| 4.29141556480353 | 1.044 | 1.309 | 1.999 |
| 4.294557157457119 | 1.045 | 1.31 | 2.007 |
| 4.29769875011071 | 1.045 | 1.312 | 2.016 |
| 4.300840342764299 | 1.045 | 1.313 | 2.024 |
| 4.303981935417888 | 1.045 | 1.314 | 2.033 |
| 4.307123528071478 | 1.045 | 1.316 | 2.042 |
| 4.310265120725067 | 1.045 | 1.317 | 2.05 |
| 4.313406713378657 | 1.045 | 1.318 | 2.059 |
| 4.316548306032247 | 1.045 | 1.32 | 2.068 |
| 4.319689898685836 | 1.046 | 1.321 | 2.077 |
| 4.322831491339426 | 1.046 | 1.322 | 2.086 |
| 4.325973083993015 | 1.046 | 1.323 | 2.095 |
| 4.329114676646605 | 1.046 | 1.325 | 2.104 |
| 4.332256269300195 | 1.046 | 1.326 | 2.113 |
| 4.335397861953784 | 1.046 | 1.327 | 2.123 |
| 4.338539454607374 | 1.046 | 1.328 | 2.132 |
| 4.341681047260963 | 1.046 | 1.33 | 2.141 |
| 4.344822639914553 | 1.047 | 1.331 | 2.151 |
| 4.347964232568143 | 1.047 | 1.332 | 2.16 |
| 4.351105825221732 | 1.047 | 1.333 | 2.17 |
| 4.354247417875322 | 1.047 | 1.335 | 2.179 |
| 4.357389010528911 | 1.047 | 1.336 | 2.189 |
| 4.360530603182501 | 1.047 | 1.337 | 2.198 |
| 4.36367219583609 | 1.047 | 1.338 | 2.208 |
| 4.36681378848968 | 1.047 | 1.339 | 2.218 |
| 4.36995538114327 | 1.048 | 1.341 | 2.228 |
| 4.373096973796859 | 1.048 | 1.342 | 2.238 |
| 4.376238566450449 | 1.048 | 1.343 | 2.248 |
| 4.379380159104038 | 1.048 | 1.344 | 2.258 |
| 4.382521751757628 | 1.048 | 1.345 | 2.268 |
| 4.385663344411217 | 1.048 | 1.347 | 2.278 |
| 4.388804937064807 | 1.048 | 1.348 | 2.288 |
| 4.391946529718397 | 1.048 | 1.349 | 2.298 |
| 4.395088122371987 | 1.048 | 1.35 | 2.309 |
| 4.398229715025576 | 1.049 | 1.351 | 2.319 |
| 4.401371307679165 | 1.049 | 1.352 | 2.329 |
| 4.404512900332755 | 1.049 | 1.353 | 2.34 |
| 4.407654492986345 | 1.049 | 1.355 | 2.35 |
| 4.410796085639934 | 1.049 | 1.356 | 2.361 |
| 4.413937678293524 | 1.049 | 1.357 | 2.371 |
| 4.417079270947114 | 1.049 | 1.358 | 2.382 |
| 4.420220863600703 | 1.049 | 1.359 | 2.393 |
| 4.423362456254293 | 1.049 | 1.36 | 2.403 |
| 4.426504048907883 | 1.049 | 1.361 | 2.414 |
| 4.429645641561472 | 1.05 | 1.362 | 2.425 |
| 4.432787234215062 | 1.05 | 1.363 | 2.436 |
| 4.435928826868651 | 1.05 | 1.364 | 2.447 |
| 4.43907041952224 | 1.05 | 1.365 | 2.458 |
| 4.44221201217583 | 1.05 | 1.366 | 2.468 |
| 4.44535360482942 | 1.05 | 1.367 | 2.479 |
| 4.44849519748301 | 1.05 | 1.368 | 2.49 |
| 4.4516367901366 | 1.05 | 1.369 | 2.501 |
| 4.454778382790188 | 1.05 | 1.37 | 2.512 |
| 4.457919975443779 | 1.05 | 1.371 | 2.524 |
| 4.461061568097368 | 1.05 | 1.372 | 2.535 |
| 4.464203160750958 | 1.051 | 1.373 | 2.546 |
| 4.467344753404547 | 1.051 | 1.374 | 2.557 |
| 4.470486346058137 | 1.051 | 1.375 | 2.568 |
| 4.473627938711726 | 1.051 | 1.376 | 2.579 |
| 4.476769531365316 | 1.051 | 1.377 | 2.59 |
| 4.479911124018905 | 1.051 | 1.378 | 2.601 |
| 4.483052716672495 | 1.051 | 1.379 | 2.613 |
| 4.486194309326085 | 1.051 | 1.38 | 2.624 |
| 4.489335901979674 | 1.051 | 1.381 | 2.635 |
| 4.492477494633264 | 1.051 | 1.382 | 2.646 |
| 4.495619087286854 | 1.051 | 1.383 | 2.657 |
| 4.498760679940443 | 1.051 | 1.383 | 2.668 |
| 4.501902272594033 | 1.052 | 1.384 | 2.679 |
| 4.505043865247622 | 1.052 | 1.385 | 2.691 |
| 4.508185457901212 | 1.052 | 1.386 | 2.702 |
| 4.511327050554801 | 1.052 | 1.387 | 2.713 |
| 4.514468643208391 | 1.052 | 1.388 | 2.724 |
| 4.517610235861981 | 1.052 | 1.388 | 2.735 |
| 4.520751828515571 | 1.052 | 1.389 | 2.746 |
| 4.52389342116916 | 1.052 | 1.39 | 2.757 |
| 4.52703501382275 | 1.052 | 1.391 | 2.767 |
| 4.530176606476339 | 1.052 | 1.392 | 2.778 |
| 4.533318199129928 | 1.052 | 1.392 | 2.789 |
| 4.536459791783518 | 1.052 | 1.393 | 2.8 |
| 4.539601384437108 | 1.052 | 1.394 | 2.81 |
| 4.542742977090698 | 1.052 | 1.394 | 2.821 |
| 4.545884569744287 | 1.052 | 1.395 | 2.832 |
| 4.549026162397876 | 1.053 | 1.396 | 2.842 |
| 4.552167755051466 | 1.053 | 1.397 | 2.852 |
| 4.555309347705056 | 1.053 | 1.397 | 2.863 |
| 4.558450940358646 | 1.053 | 1.398 | 2.873 |
| 4.561592533012235 | 1.053 | 1.399 | 2.883 |
| 4.564734125665825 | 1.053 | 1.399 | 2.893 |
| 4.567875718319415 | 1.053 | 1.4 | 2.903 |
| 4.571017310973004 | 1.053 | 1.4 | 2.913 |
| 4.574158903626594 | 1.053 | 1.401 | 2.922 |
| 4.577300496280183 | 1.053 | 1.402 | 2.932 |
| 4.580442088933772 | 1.053 | 1.402 | 2.941 |
| 4.583583681587362 | 1.053 | 1.403 | 2.951 |
| 4.586725274240952 | 1.053 | 1.403 | 2.96 |
| 4.589866866894542 | 1.053 | 1.404 | 2.969 |
| 4.593008459548131 | 1.053 | 1.404 | 2.978 |
| 4.596150052201721 | 1.053 | 1.405 | 2.987 |
| 4.59929164485531 | 1.053 | 1.405 | 2.995 |
| 4.6024332375089 | 1.053 | 1.406 | 3.004 |
| 4.60557483016249 | 1.053 | 1.406 | 3.012 |
| 4.608716422816079 | 1.053 | 1.407 | 3.02 |
| 4.611858015469668 | 1.054 | 1.407 | 3.028 |
| 4.614999608123258 | 1.054 | 1.408 | 3.036 |
| 4.618141200776848 | 1.054 | 1.408 | 3.043 |
| 4.621282793430437 | 1.054 | 1.408 | 3.051 |
| 4.624424386084027 | 1.054 | 1.409 | 3.058 |
| 4.627565978737617 | 1.054 | 1.409 | 3.065 |
| 4.630707571391206 | 1.054 | 1.41 | 3.072 |
| 4.633849164044795 | 1.054 | 1.41 | 3.078 |
| 4.636990756698386 | 1.054 | 1.41 | 3.084 |
| 4.640132349351975 | 1.054 | 1.411 | 3.091 |
| 4.643273942005564 | 1.054 | 1.411 | 3.097 |
| 4.646415534659154 | 1.054 | 1.411 | 3.102 |
| 4.649557127312744 | 1.054 | 1.411 | 3.108 |
| 4.652698719966334 | 1.054 | 1.412 | 3.113 |
| 4.655840312619923 | 1.054 | 1.412 | 3.118 |
| 4.658981905273513 | 1.054 | 1.412 | 3.122 |
| 4.662123497927102 | 1.054 | 1.412 | 3.127 |
| 4.665265090580692 | 1.054 | 1.413 | 3.131 |
| 4.668406683234282 | 1.054 | 1.413 | 3.135 |
| 4.671548275887871 | 1.054 | 1.413 | 3.139 |
| 4.674689868541461 | 1.054 | 1.413 | 3.142 |
| 4.67783146119505 | 1.054 | 1.413 | 3.145 |
| 4.68097305384864 | 1.054 | 1.414 | 3.148 |
| 4.68411464650223 | 1.054 | 1.414 | 3.151 |
| 4.687256239155819 | 1.054 | 1.414 | 3.153 |
| 4.690397831809409 | 1.054 | 1.414 | 3.155 |
| 4.693539424462998 | 1.054 | 1.414 | 3.157 |
| 4.696681017116588 | 1.054 | 1.414 | 3.159 |
| 4.699822609770177 | 1.054 | 1.414 | 3.16 |
| 4.702964202423767 | 1.054 | 1.414 | 3.161 |
| 4.706105795077356 | 1.054 | 1.414 | 3.162 |
| 4.709247387730946 | 1.054 | 1.414 | 3.162 |
| 4.712388980384535 | 1.054 | 1.414 | 3.162 |
| 4.715530573038126 | 1.054 | 1.414 | 3.162 |
| 4.718672165691715 | 1.054 | 1.414 | 3.162 |
| 4.721813758345305 | 1.054 | 1.414 | 3.161 |
| 4.724955350998894 | 1.054 | 1.414 | 3.16 |
| 4.728096943652484 | 1.054 | 1.414 | 3.159 |
| 4.731238536306074 | 1.054 | 1.414 | 3.157 |
| 4.734380128959663 | 1.054 | 1.414 | 3.155 |
| 4.737521721613253 | 1.054 | 1.414 | 3.153 |
| 4.740663314266842 | 1.054 | 1.414 | 3.151 |
| 4.743804906920432 | 1.054 | 1.414 | 3.148 |
| 4.74694649957402 | 1.054 | 1.413 | 3.145 |
| 4.750088092227611 | 1.054 | 1.413 | 3.142 |
| 4.7532296848812 | 1.054 | 1.413 | 3.139 |
| 4.75637127753479 | 1.054 | 1.413 | 3.135 |
| 4.75951287018838 | 1.054 | 1.413 | 3.131 |
| 4.76265446284197 | 1.054 | 1.412 | 3.127 |
| 4.765796055495559 | 1.054 | 1.412 | 3.122 |
| 4.768937648149149 | 1.054 | 1.412 | 3.118 |
| 4.772079240802738 | 1.054 | 1.412 | 3.113 |
| 4.775220833456327 | 1.054 | 1.411 | 3.108 |
| 4.778362426109917 | 1.054 | 1.411 | 3.102 |
| 4.781504018763507 | 1.054 | 1.411 | 3.097 |
| 4.784645611417097 | 1.054 | 1.411 | 3.091 |
| 4.787787204070686 | 1.054 | 1.41 | 3.084 |
| 4.790928796724275 | 1.054 | 1.41 | 3.078 |
| 4.794070389377865 | 1.054 | 1.41 | 3.072 |
| 4.797211982031455 | 1.054 | 1.409 | 3.065 |
| 4.800353574685045 | 1.054 | 1.409 | 3.058 |
| 4.803495167338634 | 1.054 | 1.408 | 3.051 |
| 4.806636759992224 | 1.054 | 1.408 | 3.043 |
| 4.809778352645814 | 1.054 | 1.408 | 3.036 |
| 4.812919945299403 | 1.054 | 1.407 | 3.028 |
| 4.816061537952993 | 1.053 | 1.407 | 3.02 |
| 4.819203130606582 | 1.053 | 1.406 | 3.012 |
| 4.822344723260172 | 1.053 | 1.406 | 3.004 |
| 4.825486315913761 | 1.053 | 1.405 | 2.995 |
| 4.828627908567351 | 1.053 | 1.405 | 2.987 |
| 4.83176950122094 | 1.053 | 1.404 | 2.978 |
| 4.83491109387453 | 1.053 | 1.404 | 2.969 |
| 4.83805268652812 | 1.053 | 1.403 | 2.96 |
| 4.841194279181709 | 1.053 | 1.403 | 2.951 |
| 4.844335871835299 | 1.053 | 1.402 | 2.941 |
| 4.847477464488889 | 1.053 | 1.402 | 2.932 |
| 4.850619057142478 | 1.053 | 1.401 | 2.922 |
| 4.853760649796068 | 1.053 | 1.4 | 2.913 |
| 4.856902242449657 | 1.053 | 1.4 | 2.903 |
| 4.860043835103247 | 1.053 | 1.399 | 2.893 |
| 4.863185427756837 | 1.053 | 1.399 | 2.883 |
| 4.866327020410426 | 1.053 | 1.398 | 2.873 |
| 4.869468613064015 | 1.053 | 1.397 | 2.863 |
| 4.872610205717605 | 1.053 | 1.397 | 2.852 |
| 4.875751798371195 | 1.053 | 1.396 | 2.842 |
| 4.878893391024784 | 1.052 | 1.395 | 2.832 |
| 4.882034983678374 | 1.052 | 1.394 | 2.821 |
| 4.885176576331964 | 1.052 | 1.394 | 2.81 |
| 4.888318168985553 | 1.052 | 1.393 | 2.8 |
| 4.891459761639143 | 1.052 | 1.392 | 2.789 |
| 4.894601354292733 | 1.052 | 1.392 | 2.778 |
| 4.897742946946322 | 1.052 | 1.391 | 2.767 |
| 4.900884539599912 | 1.052 | 1.39 | 2.757 |
| 4.904026132253501 | 1.052 | 1.389 | 2.746 |
| 4.907167724907091 | 1.052 | 1.388 | 2.735 |
| 4.91030931756068 | 1.052 | 1.388 | 2.724 |
| 4.91345091021427 | 1.052 | 1.387 | 2.713 |
| 4.91659250286786 | 1.052 | 1.386 | 2.702 |
| 4.91973409552145 | 1.052 | 1.385 | 2.691 |
| 4.922875688175039 | 1.052 | 1.384 | 2.679 |
| 4.926017280828628 | 1.051 | 1.383 | 2.668 |
| 4.929158873482218 | 1.051 | 1.383 | 2.657 |
| 4.932300466135808 | 1.051 | 1.382 | 2.646 |
| 4.935442058789397 | 1.051 | 1.381 | 2.635 |
| 4.938583651442987 | 1.051 | 1.38 | 2.624 |
| 4.941725244096576 | 1.051 | 1.379 | 2.613 |
| 4.944866836750166 | 1.051 | 1.378 | 2.601 |
| 4.948008429403755 | 1.051 | 1.377 | 2.59 |
| 4.951150022057345 | 1.051 | 1.376 | 2.579 |
| 4.954291614710935 | 1.051 | 1.375 | 2.568 |
| 4.957433207364524 | 1.051 | 1.374 | 2.557 |
| 4.960574800018114 | 1.051 | 1.373 | 2.546 |
| 4.963716392671704 | 1.05 | 1.372 | 2.535 |
| 4.966857985325293 | 1.05 | 1.371 | 2.524 |
| 4.969999577978883 | 1.05 | 1.37 | 2.512 |
| 4.973141170632472 | 1.05 | 1.369 | 2.501 |
| 4.976282763286062 | 1.05 | 1.368 | 2.49 |
| 4.979424355939651 | 1.05 | 1.367 | 2.479 |
| 4.982565948593241 | 1.05 | 1.366 | 2.468 |
| 4.985707541246831 | 1.05 | 1.365 | 2.458 |
| 4.98884913390042 | 1.05 | 1.364 | 2.447 |
| 4.99199072655401 | 1.05 | 1.363 | 2.436 |
| 4.9951323192076 | 1.05 | 1.362 | 2.425 |
| 4.99827391186119 | 1.049 | 1.361 | 2.414 |
| 5.00141550451478 | 1.049 | 1.36 | 2.403 |
| 5.004557097168369 | 1.049 | 1.359 | 2.393 |
| 5.007698689821958 | 1.049 | 1.358 | 2.382 |
| 5.010840282475548 | 1.049 | 1.357 | 2.371 |
| 5.013981875129137 | 1.049 | 1.356 | 2.361 |
| 5.017123467782727 | 1.049 | 1.355 | 2.35 |
| 5.020265060436317 | 1.049 | 1.353 | 2.34 |
| 5.023406653089906 | 1.049 | 1.352 | 2.329 |
| 5.026548245743496 | 1.049 | 1.351 | 2.319 |
| 5.029689838397085 | 1.048 | 1.35 | 2.309 |
| 5.032831431050674 | 1.048 | 1.349 | 2.298 |
| 5.035973023704264 | 1.048 | 1.348 | 2.288 |
| 5.039114616357854 | 1.048 | 1.347 | 2.278 |
| 5.042256209011444 | 1.048 | 1.345 | 2.268 |
| 5.045397801665033 | 1.048 | 1.344 | 2.258 |
| 5.048539394318622 | 1.048 | 1.343 | 2.248 |
| 5.051680986972213 | 1.048 | 1.342 | 2.238 |
| 5.054822579625802 | 1.048 | 1.341 | 2.228 |
| 5.057964172279392 | 1.047 | 1.339 | 2.218 |
| 5.061105764932981 | 1.047 | 1.338 | 2.208 |
| 5.064247357586571 | 1.047 | 1.337 | 2.198 |
| 5.067388950240161 | 1.047 | 1.336 | 2.189 |
| 5.07053054289375 | 1.047 | 1.335 | 2.179 |
| 5.07367213554734 | 1.047 | 1.333 | 2.17 |
| 5.07681372820093 | 1.047 | 1.332 | 2.16 |
| 5.079955320854519 | 1.047 | 1.331 | 2.151 |
| 5.083096913508108 | 1.046 | 1.33 | 2.141 |
| 5.086238506161698 | 1.046 | 1.328 | 2.132 |
| 5.089380098815288 | 1.046 | 1.327 | 2.123 |
| 5.092521691468877 | 1.046 | 1.326 | 2.113 |
| 5.095663284122466 | 1.046 | 1.325 | 2.104 |
| 5.098804876776057 | 1.046 | 1.323 | 2.095 |
| 5.101946469429646 | 1.046 | 1.322 | 2.086 |
| 5.105088062083236 | 1.046 | 1.321 | 2.077 |
| 5.108229654736825 | 1.045 | 1.32 | 2.068 |
| 5.111371247390415 | 1.045 | 1.318 | 2.059 |
| 5.114512840044005 | 1.045 | 1.317 | 2.05 |
| 5.117654432697594 | 1.045 | 1.316 | 2.042 |
| 5.120796025351184 | 1.045 | 1.314 | 2.033 |
| 5.123937618004773 | 1.045 | 1.313 | 2.024 |
| 5.127079210658363 | 1.045 | 1.312 | 2.016 |
| 5.130220803311953 | 1.045 | 1.31 | 2.007 |
| 5.133362395965542 | 1.044 | 1.309 | 1.999 |
| 5.136503988619131 | 1.044 | 1.308 | 1.99 |
| 5.13964558127272 | 1.044 | 1.306 | 1.982 |
| 5.142787173926311 | 1.044 | 1.305 | 1.974 |
| 5.1459287665799 | 1.044 | 1.304 | 1.966 |
| 5.14907035923349 | 1.044 | 1.303 | 1.957 |
| 5.15221195188708 | 1.044 | 1.301 | 1.949 |
| 5.15535354454067 | 1.043 | 1.3 | 1.941 |
| 5.158495137194259 | 1.043 | 1.299 | 1.933 |
| 5.161636729847848 | 1.043 | 1.297 | 1.925 |
| 5.164778322501438 | 1.043 | 1.296 | 1.918 |
| 5.167919915155028 | 1.043 | 1.294 | 1.91 |
| 5.171061507808617 | 1.043 | 1.293 | 1.902 |
| 5.174203100462206 | 1.043 | 1.292 | 1.894 |
| 5.177344693115796 | 1.043 | 1.29 | 1.887 |
| 5.180486285769386 | 1.042 | 1.289 | 1.879 |
| 5.183627878422976 | 1.042 | 1.288 | 1.872 |
| 5.186769471076565 | 1.042 | 1.286 | 1.864 |
| 5.189911063730155 | 1.042 | 1.285 | 1.857 |
| 5.193052656383744 | 1.042 | 1.284 | 1.849 |
| 5.196194249037334 | 1.042 | 1.282 | 1.842 |
| 5.199335841690924 | 1.041 | 1.281 | 1.835 |
| 5.202477434344513 | 1.041 | 1.28 | 1.828 |
| 5.205619026998103 | 1.041 | 1.278 | 1.82 |
| 5.208760619651692 | 1.041 | 1.277 | 1.813 |
| 5.211902212305282 | 1.041 | 1.275 | 1.806 |
| 5.215043804958871 | 1.041 | 1.274 | 1.799 |
| 5.218185397612461 | 1.041 | 1.273 | 1.792 |
| 5.221326990266051 | 1.04 | 1.271 | 1.786 |
| 5.22446858291964 | 1.04 | 1.27 | 1.779 |
| 5.22761017557323 | 1.04 | 1.269 | 1.772 |
| 5.23075176822682 | 1.04 | 1.267 | 1.765 |
| 5.23389336088041 | 1.04 | 1.266 | 1.759 |
| 5.237034953533999 | 1.04 | 1.264 | 1.752 |
| 5.240176546187588 | 1.04 | 1.263 | 1.745 |
| 5.243318138841178 | 1.039 | 1.262 | 1.739 |
| 5.246459731494767 | 1.039 | 1.26 | 1.732 |
| 5.249601324148357 | 1.039 | 1.259 | 1.726 |
| 5.252742916801947 | 1.039 | 1.258 | 1.72 |
| 5.255884509455536 | 1.039 | 1.256 | 1.713 |
| 5.259026102109125 | 1.039 | 1.255 | 1.707 |
| 5.262167694762715 | 1.038 | 1.253 | 1.701 |
| 5.265309287416305 | 1.038 | 1.252 | 1.695 |
| 5.268450880069895 | 1.038 | 1.251 | 1.688 |
| 5.271592472723484 | 1.038 | 1.249 | 1.682 |
| 5.274734065377074 | 1.038 | 1.248 | 1.676 |
| 5.277875658030664 | 1.038 | 1.247 | 1.67 |
| 5.281017250684253 | 1.038 | 1.245 | 1.664 |
| 5.284158843337843 | 1.037 | 1.244 | 1.659 |
| 5.287300435991432 | 1.037 | 1.242 | 1.653 |
| 5.290442028645022 | 1.037 | 1.241 | 1.647 |
| 5.293583621298612 | 1.037 | 1.24 | 1.641 |
| 5.296725213952201 | 1.037 | 1.238 | 1.635 |
| 5.299866806605791 | 1.037 | 1.237 | 1.63 |
| 5.30300839925938 | 1.036 | 1.236 | 1.624 |
| 5.30614999191297 | 1.036 | 1.234 | 1.619 |
| 5.30929158456656 | 1.036 | 1.233 | 1.613 |
| 5.312433177220149 | 1.036 | 1.231 | 1.608 |
| 5.315574769873739 | 1.036 | 1.23 | 1.602 |
| 5.318716362527328 | 1.036 | 1.229 | 1.597 |
| 5.321857955180918 | 1.035 | 1.227 | 1.591 |
| 5.324999547834508 | 1.035 | 1.226 | 1.586 |
| 5.328141140488097 | 1.035 | 1.225 | 1.581 |
| 5.331282733141686 | 1.035 | 1.223 | 1.575 |
| 5.334424325795276 | 1.035 | 1.222 | 1.57 |
| 5.337565918448866 | 1.035 | 1.221 | 1.565 |
| 5.340707511102456 | 1.034 | 1.219 | 1.56 |
| 5.343849103756045 | 1.034 | 1.218 | 1.555 |
| 5.346990696409634 | 1.034 | 1.216 | 1.55 |
| 5.350132289063224 | 1.034 | 1.215 | 1.545 |
| 5.353273881716814 | 1.034 | 1.214 | 1.54 |
| 5.356415474370403 | 1.034 | 1.212 | 1.535 |
| 5.359557067023993 | 1.033 | 1.211 | 1.53 |
| 5.362698659677583 | 1.033 | 1.21 | 1.525 |
| 5.365840252331172 | 1.033 | 1.208 | 1.52 |
| 5.368981844984762 | 1.033 | 1.207 | 1.516 |
| 5.372123437638351 | 1.033 | 1.206 | 1.511 |
| 5.375265030291941 | 1.033 | 1.204 | 1.506 |
| 5.378406622945531 | 1.032 | 1.203 | 1.501 |
| 5.38154821559912 | 1.032 | 1.202 | 1.497 |
| 5.38468980825271 | 1.032 | 1.2 | 1.492 |
| 5.387831400906299 | 1.032 | 1.199 | 1.488 |
| 5.39097299355989 | 1.032 | 1.198 | 1.483 |
| 5.394114586213479 | 1.032 | 1.196 | 1.479 |
| 5.397256178867068 | 1.031 | 1.195 | 1.474 |
| 5.400397771520657 | 1.031 | 1.194 | 1.47 |
| 5.403539364174247 | 1.031 | 1.193 | 1.465 |
| 5.406680956827837 | 1.031 | 1.191 | 1.461 |
| 5.409822549481426 | 1.031 | 1.19 | 1.457 |
| 5.412964142135016 | 1.031 | 1.189 | 1.452 |
| 5.416105734788605 | 1.03 | 1.187 | 1.448 |
| 5.419247327442195 | 1.03 | 1.186 | 1.444 |
| 5.422388920095785 | 1.03 | 1.185 | 1.44 |
| 5.425530512749375 | 1.03 | 1.183 | 1.436 |
| 5.428672105402964 | 1.03 | 1.182 | 1.432 |
| 5.431813698056554 | 1.03 | 1.181 | 1.427 |
| 5.434955290710143 | 1.029 | 1.18 | 1.423 |
| 5.438096883363733 | 1.029 | 1.178 | 1.419 |
| 5.441238476017322 | 1.029 | 1.177 | 1.415 |
| 5.444380068670912 | 1.029 | 1.176 | 1.411 |
| 5.447521661324502 | 1.029 | 1.175 | 1.407 |
| 5.450663253978091 | 1.029 | 1.173 | 1.404 |
| 5.453804846631681 | 1.028 | 1.172 | 1.4 |
| 5.456946439285271 | 1.028 | 1.171 | 1.396 |
| 5.46008803193886 | 1.028 | 1.169 | 1.392 |
| 5.46322962459245 | 1.028 | 1.168 | 1.388 |
| 5.466371217246039 | 1.028 | 1.167 | 1.384 |
| 5.46951280989963 | 1.028 | 1.166 | 1.381 |
| 5.472654402553218 | 1.027 | 1.164 | 1.377 |
| 5.475795995206808 | 1.027 | 1.163 | 1.373 |
| 5.478937587860398 | 1.027 | 1.162 | 1.37 |
| 5.482079180513987 | 1.027 | 1.161 | 1.366 |
| 5.485220773167577 | 1.027 | 1.16 | 1.362 |
| 5.488362365821166 | 1.026 | 1.158 | 1.359 |
| 5.491503958474756 | 1.026 | 1.157 | 1.355 |
| 5.494645551128346 | 1.026 | 1.156 | 1.352 |
| 5.497787143781935 | 1.026 | 1.155 | 1.348 |
| 5.500928736435525 | 1.026 | 1.153 | 1.345 |
| 5.504070329089115 | 1.026 | 1.152 | 1.342 |
| 5.507211921742704 | 1.025 | 1.151 | 1.338 |
| 5.510353514396294 | 1.025 | 1.15 | 1.335 |
| 5.513495107049883 | 1.025 | 1.149 | 1.331 |
| 5.516636699703473 | 1.025 | 1.148 | 1.328 |
| 5.519778292357062 | 1.025 | 1.146 | 1.325 |
| 5.522919885010652 | 1.025 | 1.145 | 1.322 |
| 5.526061477664242 | 1.024 | 1.144 | 1.318 |
| 5.529203070317831 | 1.024 | 1.143 | 1.315 |
| 5.532344662971421 | 1.024 | 1.142 | 1.312 |
| 5.535486255625011 | 1.024 | 1.14 | 1.309 |
| 5.5386278482786 | 1.024 | 1.139 | 1.306 |
| 5.54176944093219 | 1.024 | 1.138 | 1.302 |
| 5.544911033585779 | 1.023 | 1.137 | 1.299 |
| 5.54805262623937 | 1.023 | 1.136 | 1.296 |
| 5.551194218892959 | 1.023 | 1.135 | 1.293 |
| 5.554335811546548 | 1.023 | 1.134 | 1.29 |
| 5.557477404200137 | 1.023 | 1.132 | 1.287 |
| 5.560618996853727 | 1.023 | 1.131 | 1.284 |
| 5.563760589507317 | 1.022 | 1.13 | 1.281 |
| 5.566902182160906 | 1.022 | 1.129 | 1.278 |
| 5.570043774814496 | 1.022 | 1.128 | 1.275 |
| 5.573185367468086 | 1.022 | 1.127 | 1.272 |
| 5.576326960121675 | 1.022 | 1.126 | 1.27 |
| 5.579468552775264 | 1.022 | 1.125 | 1.267 |
| 5.582610145428854 | 1.021 | 1.124 | 1.264 |
| 5.585751738082444 | 1.021 | 1.122 | 1.261 |
| 5.588893330736034 | 1.021 | 1.121 | 1.258 |
| 5.592034923389623 | 1.021 | 1.12 | 1.256 |
| 5.595176516043213 | 1.021 | 1.119 | 1.253 |
| 5.598318108696803 | 1.021 | 1.118 | 1.25 |
| 5.601459701350392 | 1.02 | 1.117 | 1.247 |
| 5.604601294003982 | 1.02 | 1.116 | 1.245 |
| 5.607742886657571 | 1.02 | 1.115 | 1.242 |
| 5.610884479311161 | 1.02 | 1.114 | 1.239 |
| 5.61402607196475 | 1.02 | 1.113 | 1.237 |
| 5.61716766461834 | 1.02 | 1.112 | 1.234 |
| 5.62030925727193 | 1.019 | 1.111 | 1.232 |
| 5.623450849925519 | 1.019 | 1.11 | 1.229 |
| 5.626592442579109 | 1.019 | 1.109 | 1.227 |
| 5.629734035232698 | 1.019 | 1.108 | 1.224 |
| 5.632875627886288 | 1.019 | 1.107 | 1.222 |
| 5.636017220539878 | 1.019 | 1.106 | 1.219 |
| 5.639158813193467 | 1.019 | 1.104 | 1.217 |
| 5.642300405847057 | 1.018 | 1.103 | 1.214 |
| 5.645441998500646 | 1.018 | 1.102 | 1.212 |
| 5.648583591154236 | 1.018 | 1.101 | 1.209 |
| 5.651725183807825 | 1.018 | 1.1 | 1.207 |
| 5.654866776461415 | 1.018 | 1.099 | 1.205 |
| 5.658008369115005 | 1.018 | 1.098 | 1.202 |
| 5.661149961768594 | 1.017 | 1.097 | 1.2 |
| 5.664291554422184 | 1.017 | 1.097 | 1.198 |
| 5.667433147075774 | 1.017 | 1.096 | 1.195 |
| 5.670574739729363 | 1.017 | 1.095 | 1.193 |
| 5.673716332382953 | 1.017 | 1.094 | 1.191 |
| 5.676857925036542 | 1.017 | 1.093 | 1.189 |
| 5.679999517690132 | 1.016 | 1.092 | 1.186 |
| 5.683141110343721 | 1.016 | 1.091 | 1.184 |
| 5.686282702997311 | 1.016 | 1.09 | 1.182 |
| 5.689424295650901 | 1.016 | 1.089 | 1.18 |
| 5.69256588830449 | 1.016 | 1.088 | 1.178 |
| 5.69570748095808 | 1.016 | 1.087 | 1.176 |
| 5.69884907361167 | 1.016 | 1.086 | 1.174 |
| 5.701990666265259 | 1.015 | 1.085 | 1.171 |
| 5.705132258918849 | 1.015 | 1.084 | 1.169 |
| 5.708273851572438 | 1.015 | 1.083 | 1.167 |
| 5.711415444226028 | 1.015 | 1.082 | 1.165 |
| 5.714557036879618 | 1.015 | 1.081 | 1.163 |
| 5.717698629533207 | 1.015 | 1.081 | 1.161 |
| 5.720840222186797 | 1.015 | 1.08 | 1.159 |
| 5.723981814840386 | 1.014 | 1.079 | 1.157 |
| 5.727123407493976 | 1.014 | 1.078 | 1.155 |
| 5.730265000147565 | 1.014 | 1.077 | 1.153 |
| 5.733406592801155 | 1.014 | 1.076 | 1.151 |
| 5.736548185454744 | 1.014 | 1.075 | 1.149 |
| 5.739689778108334 | 1.014 | 1.074 | 1.148 |
| 5.742831370761924 | 1.014 | 1.074 | 1.146 |
| 5.745972963415514 | 1.013 | 1.073 | 1.144 |
| 5.749114556069103 | 1.013 | 1.072 | 1.142 |
| 5.752256148722693 | 1.013 | 1.071 | 1.14 |
| 5.755397741376282 | 1.013 | 1.07 | 1.138 |
| 5.758539334029872 | 1.013 | 1.069 | 1.137 |
| 5.761680926683462 | 1.013 | 1.068 | 1.135 |
| 5.764822519337051 | 1.013 | 1.068 | 1.133 |
| 5.767964111990641 | 1.012 | 1.067 | 1.131 |
| 5.77110570464423 | 1.012 | 1.066 | 1.129 |
| 5.77424729729782 | 1.012 | 1.065 | 1.128 |
| 5.77738888995141 | 1.012 | 1.064 | 1.126 |
| 5.780530482605 | 1.012 | 1.064 | 1.124 |
| 5.783672075258588 | 1.012 | 1.063 | 1.123 |
| 5.786813667912178 | 1.012 | 1.062 | 1.121 |
| 5.789955260565768 | 1.011 | 1.061 | 1.119 |
| 5.793096853219358 | 1.011 | 1.06 | 1.118 |
| 5.796238445872947 | 1.011 | 1.06 | 1.116 |
| 5.799380038526537 | 1.011 | 1.059 | 1.114 |
| 5.802521631180126 | 1.011 | 1.058 | 1.113 |
| 5.805663223833715 | 1.011 | 1.057 | 1.111 |
| 5.808804816487306 | 1.011 | 1.057 | 1.11 |
| 5.811946409140895 | 1.01 | 1.056 | 1.108 |
| 5.815088001794485 | 1.01 | 1.055 | 1.106 |
| 5.818229594448074 | 1.01 | 1.054 | 1.105 |
| 5.821371187101663 | 1.01 | 1.054 | 1.103 |
| 5.824512779755254 | 1.01 | 1.053 | 1.102 |
| 5.827654372408843 | 1.01 | 1.052 | 1.1 |
| 5.830795965062433 | 1.01 | 1.051 | 1.099 |
| 5.833937557716022 | 1.01 | 1.051 | 1.097 |
| 5.837079150369612 | 1.009 | 1.05 | 1.096 |
| 5.840220743023201 | 1.009 | 1.049 | 1.095 |
| 5.843362335676791 | 1.009 | 1.049 | 1.093 |
| 5.846503928330381 | 1.009 | 1.048 | 1.092 |
| 5.84964552098397 | 1.009 | 1.047 | 1.09 |
| 5.85278711363756 | 1.009 | 1.047 | 1.089 |
| 5.85592870629115 | 1.009 | 1.046 | 1.088 |
| 5.85907029894474 | 1.009 | 1.045 | 1.086 |
| 5.862211891598329 | 1.008 | 1.045 | 1.085 |
| 5.865353484251918 | 1.008 | 1.044 | 1.084 |
| 5.868495076905508 | 1.008 | 1.043 | 1.082 |
| 5.871636669559098 | 1.008 | 1.043 | 1.081 |
| 5.874778262212687 | 1.008 | 1.042 | 1.08 |
| 5.877919854866277 | 1.008 | 1.041 | 1.078 |
| 5.881061447519866 | 1.008 | 1.041 | 1.077 |
| 5.884203040173456 | 1.008 | 1.04 | 1.076 |
| 5.887344632827046 | 1.008 | 1.039 | 1.074 |
| 5.890486225480635 | 1.007 | 1.039 | 1.073 |
| 5.893627818134224 | 1.007 | 1.038 | 1.072 |
| 5.896769410787814 | 1.007 | 1.038 | 1.071 |
| 5.899911003441404 | 1.007 | 1.037 | 1.07 |
| 5.903052596094994 | 1.007 | 1.036 | 1.068 |
| 5.906194188748583 | 1.007 | 1.036 | 1.067 |
| 5.909335781402172 | 1.007 | 1.035 | 1.066 |
| 5.912477374055762 | 1.007 | 1.035 | 1.065 |
| 5.915618966709352 | 1.007 | 1.034 | 1.064 |
| 5.918760559362942 | 1.006 | 1.033 | 1.063 |
| 5.921902152016531 | 1.006 | 1.033 | 1.061 |
| 5.92504374467012 | 1.006 | 1.032 | 1.06 |
| 5.92818533732371 | 1.006 | 1.032 | 1.059 |
| 5.9313269299773 | 1.006 | 1.031 | 1.058 |
| 5.93446852263089 | 1.006 | 1.031 | 1.057 |
| 5.93761011528448 | 1.006 | 1.03 | 1.056 |
| 5.940751707938068 | 1.006 | 1.029 | 1.055 |
| 5.943893300591658 | 1.006 | 1.029 | 1.054 |
| 5.947034893245248 | 1.005 | 1.028 | 1.053 |
| 5.950176485898837 | 1.005 | 1.028 | 1.052 |
| 5.953318078552427 | 1.005 | 1.027 | 1.051 |
| 5.956459671206017 | 1.005 | 1.027 | 1.05 |
| 5.959601263859606 | 1.005 | 1.026 | 1.049 |
| 5.962742856513196 | 1.005 | 1.026 | 1.048 |
| 5.965884449166785 | 1.005 | 1.025 | 1.047 |
| 5.969026041820375 | 1.005 | 1.025 | 1.046 |
| 5.972167634473964 | 1.005 | 1.024 | 1.045 |
| 5.975309227127554 | 1.005 | 1.024 | 1.044 |
| 5.978450819781144 | 1.005 | 1.023 | 1.043 |
| 5.981592412434733 | 1.004 | 1.023 | 1.042 |
| 5.984734005088323 | 1.004 | 1.022 | 1.041 |
| 5.987875597741913 | 1.004 | 1.022 | 1.04 |
| 5.991017190395502 | 1.004 | 1.021 | 1.04 |
| 5.994158783049092 | 1.004 | 1.021 | 1.039 |
| 5.997300375702681 | 1.004 | 1.02 | 1.038 |
| 6.000441968356271 | 1.004 | 1.02 | 1.037 |
| 6.003583561009861 | 1.004 | 1.02 | 1.036 |
| 6.00672515366345 | 1.004 | 1.019 | 1.035 |
| 6.00986674631704 | 1.004 | 1.019 | 1.034 |
| 6.01300833897063 | 1.004 | 1.018 | 1.034 |
| 6.01614993162422 | 1.003 | 1.018 | 1.033 |
| 6.019291524277808 | 1.003 | 1.017 | 1.032 |
| 6.022433116931398 | 1.003 | 1.017 | 1.031 |
| 6.025574709584988 | 1.003 | 1.017 | 1.031 |
| 6.028716302238577 | 1.003 | 1.016 | 1.03 |
| 6.031857894892167 | 1.003 | 1.016 | 1.029 |
| 6.034999487545757 | 1.003 | 1.015 | 1.028 |
| 6.038141080199346 | 1.003 | 1.015 | 1.028 |
| 6.041282672852935 | 1.003 | 1.015 | 1.027 |
| 6.044424265506525 | 1.003 | 1.014 | 1.026 |
| 6.047565858160115 | 1.003 | 1.014 | 1.025 |
| 6.050707450813704 | 1.003 | 1.014 | 1.025 |
| 6.053849043467294 | 1.003 | 1.013 | 1.024 |
| 6.056990636120884 | 1.003 | 1.013 | 1.023 |
| 6.060132228774473 | 1.002 | 1.012 | 1.023 |
| 6.063273821428063 | 1.002 | 1.012 | 1.022 |
| 6.066415414081653 | 1.002 | 1.012 | 1.021 |
| 6.069557006735242 | 1.002 | 1.011 | 1.021 |
| 6.072698599388831 | 1.002 | 1.011 | 1.02 |
| 6.07584019204242 | 1.002 | 1.011 | 1.02 |
| 6.078981784696011 | 1.002 | 1.01 | 1.019 |
| 6.082123377349601 | 1.002 | 1.01 | 1.018 |
| 6.08526497000319 | 1.002 | 1.01 | 1.018 |
| 6.08840656265678 | 1.002 | 1.009 | 1.017 |
| 6.09154815531037 | 1.002 | 1.009 | 1.017 |
| 6.094689747963959 | 1.002 | 1.009 | 1.016 |
| 6.097831340617549 | 1.002 | 1.009 | 1.016 |
| 6.100972933271138 | 1.002 | 1.008 | 1.015 |
| 6.104114525924728 | 1.002 | 1.008 | 1.015 |
| 6.107256118578317 | 1.002 | 1.008 | 1.014 |
| 6.110397711231907 | 1.001 | 1.007 | 1.014 |
| 6.113539303885497 | 1.001 | 1.007 | 1.013 |
| 6.116680896539086 | 1.001 | 1.007 | 1.013 |
| 6.119822489192675 | 1.001 | 1.007 | 1.012 |
| 6.122964081846265 | 1.001 | 1.006 | 1.012 |
| 6.126105674499855 | 1.001 | 1.006 | 1.011 |
| 6.129247267153445 | 1.001 | 1.006 | 1.011 |
| 6.132388859807034 | 1.001 | 1.006 | 1.01 |
| 6.135530452460624 | 1.001 | 1.005 | 1.01 |
| 6.138672045114213 | 1.001 | 1.005 | 1.009 |
| 6.141813637767803 | 1.001 | 1.005 | 1.009 |
| 6.144955230421393 | 1.001 | 1.005 | 1.009 |
| 6.148096823074982 | 1.001 | 1.005 | 1.008 |
| 6.151238415728571 | 1.001 | 1.004 | 1.008 |
| 6.154380008382161 | 1.001 | 1.004 | 1.008 |
| 6.157521601035751 | 1.001 | 1.004 | 1.007 |
| 6.16066319368934 | 1.001 | 1.004 | 1.007 |
| 6.16380478634293 | 1.001 | 1.004 | 1.006 |
| 6.16694637899652 | 1.001 | 1.003 | 1.006 |
| 6.170087971650109 | 1.001 | 1.003 | 1.006 |
| 6.173229564303698 | 1.001 | 1.003 | 1.005 |
| 6.176371156957289 | 1.001 | 1.003 | 1.005 |
| 6.179512749610878 | 1.001 | 1.003 | 1.005 |
| 6.182654342264468 | 1.001 | 1.003 | 1.005 |
| 6.185795934918057 | 1 | 1.002 | 1.004 |
| 6.188937527571647 | 1 | 1.002 | 1.004 |
| 6.192079120225237 | 1 | 1.002 | 1.004 |
| 6.195220712878826 | 1 | 1.002 | 1.003 |
| 6.198362305532415 | 1 | 1.002 | 1.003 |
| 6.201503898186005 | 1 | 1.002 | 1.003 |
| 6.204645490839594 | 1 | 1.002 | 1.003 |
| 6.207787083493184 | 1 | 1.001 | 1.003 |
| 6.210928676146774 | 1 | 1.001 | 1.002 |
| 6.214070268800364 | 1 | 1.001 | 1.002 |
| 6.217211861453953 | 1 | 1.001 | 1.002 |
| 6.220353454107543 | 1 | 1.001 | 1.002 |
| 6.223495046761133 | 1 | 1.001 | 1.002 |
| 6.226636639414722 | 1 | 1.001 | 1.001 |
| 6.229778232068312 | 1 | 1.001 | 1.001 |
| 6.232919824721901 | 1 | 1.001 | 1.001 |
| 6.236061417375491 | 1 | 1.001 | 1.001 |
| 6.23920301002908 | 1 | 1 | 1.001 |
| 6.24234460268267 | 1 | 1 | 1.001 |
| 6.24548619533626 | 1 | 1 | 1.001 |
| 6.24862778798985 | 1 | 1 | 1.001 |
| 6.251769380643438 | 1 | 1 | 1 |
| 6.254910973297028 | 1 | 1 | 1 |
| 6.258052565950618 | 1 | 1 | 1 |
| 6.261194158604208 | 1 | 1 | 1 |
| 6.264335751257797 | 1 | 1 | 1 |
| 6.267477343911387 | 1 | 1 | 1 |
| 6.270618936564976 | 1 | 1 | 1 |
| 6.273760529218566 | 1 | 1 | 1 |
| 6.276902121872155 | 1 | 1 | 1 |
| 6.280043714525745 | 1 | 1 | 1 |
| 6.283185307179335 | 1 | 1 | 1 |